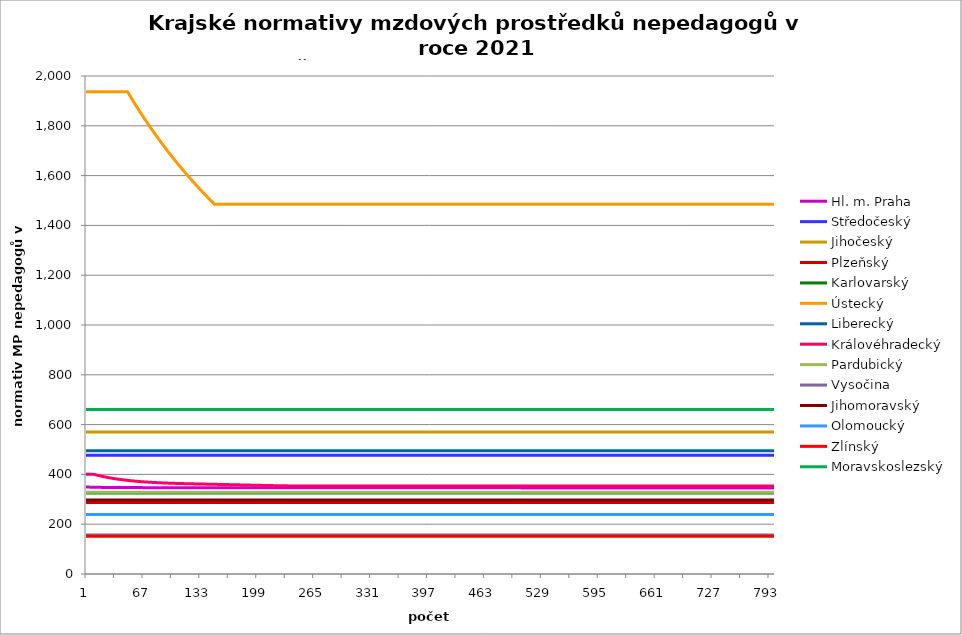
| Category | Hl. m. Praha | Středočeský | Jihočeský | Plzeňský | Karlovarský  | Ústecký   | Liberecký | Královéhradecký | Pardubický | Vysočina | Jihomoravský | Olomoucký | Zlínský | Moravskoslezský |
|---|---|---|---|---|---|---|---|---|---|---|---|---|---|---|
| 0 | 350.229 | 476.411 | 570.336 | 287.547 | 325.5 | 1937.113 | 495 | 400.548 | 328.432 | 156.391 | 297.28 | 238.483 | 151.2 | 660.577 |
| 1 | 349.669 | 476.411 | 570.336 | 287.547 | 325.5 | 1937.113 | 495 | 400.548 | 328.432 | 156.391 | 297.28 | 238.483 | 151.2 | 660.577 |
| 2 | 349.345 | 476.411 | 570.336 | 287.547 | 325.5 | 1937.113 | 495 | 400.548 | 328.432 | 156.391 | 297.28 | 238.483 | 151.2 | 660.577 |
| 3 | 349.116 | 476.411 | 570.336 | 287.547 | 325.5 | 1937.113 | 495 | 400.548 | 328.432 | 156.391 | 297.28 | 238.483 | 151.2 | 660.577 |
| 4 | 348.938 | 476.411 | 570.336 | 287.547 | 325.5 | 1937.113 | 495 | 400.548 | 328.432 | 156.391 | 297.28 | 238.483 | 151.2 | 660.577 |
| 5 | 348.794 | 476.411 | 570.336 | 287.547 | 325.5 | 1937.113 | 495 | 400.548 | 328.432 | 156.391 | 297.28 | 238.483 | 151.2 | 660.577 |
| 6 | 348.67 | 476.411 | 570.336 | 287.547 | 325.5 | 1937.113 | 495 | 400.548 | 328.432 | 156.391 | 297.28 | 238.483 | 151.2 | 660.577 |
| 7 | 348.56 | 476.411 | 570.336 | 287.547 | 325.5 | 1937.113 | 495 | 400.548 | 328.432 | 156.391 | 297.28 | 238.483 | 151.2 | 660.577 |
| 8 | 348.466 | 476.411 | 570.336 | 287.547 | 325.5 | 1937.113 | 495 | 400.548 | 328.432 | 156.391 | 297.28 | 238.483 | 151.2 | 660.577 |
| 9 | 348.382 | 476.411 | 570.336 | 287.547 | 325.5 | 1937.113 | 495 | 400.548 | 328.432 | 156.391 | 297.28 | 238.483 | 151.2 | 660.577 |
| 10 | 348.308 | 476.411 | 570.336 | 287.547 | 325.5 | 1937.113 | 495 | 399.617 | 328.432 | 156.391 | 297.28 | 238.483 | 151.2 | 660.577 |
| 11 | 348.239 | 476.411 | 570.336 | 287.547 | 325.5 | 1937.113 | 495 | 398.705 | 328.432 | 156.391 | 297.28 | 238.483 | 151.2 | 660.577 |
| 12 | 348.174 | 476.411 | 570.336 | 287.547 | 325.5 | 1937.113 | 495 | 397.81 | 328.432 | 156.391 | 297.28 | 238.483 | 151.2 | 660.577 |
| 13 | 348.115 | 476.411 | 570.336 | 287.547 | 325.5 | 1937.113 | 495 | 396.94 | 328.432 | 156.391 | 297.28 | 238.483 | 151.2 | 660.577 |
| 14 | 348.061 | 476.411 | 570.336 | 287.547 | 325.5 | 1937.113 | 495 | 396.087 | 328.432 | 156.391 | 297.28 | 238.483 | 151.2 | 660.577 |
| 15 | 348.011 | 476.411 | 570.336 | 287.547 | 325.5 | 1937.113 | 495 | 395.25 | 328.432 | 156.391 | 297.28 | 238.483 | 151.2 | 660.577 |
| 16 | 347.962 | 476.411 | 570.336 | 287.547 | 325.5 | 1937.113 | 495 | 394.437 | 328.432 | 156.391 | 297.28 | 238.483 | 151.2 | 660.577 |
| 17 | 347.917 | 476.411 | 570.336 | 287.547 | 325.5 | 1937.113 | 495 | 393.635 | 328.432 | 156.391 | 297.28 | 238.483 | 151.2 | 660.577 |
| 18 | 347.873 | 476.411 | 570.336 | 287.547 | 325.5 | 1937.113 | 495 | 392.855 | 328.432 | 156.391 | 297.28 | 238.483 | 151.2 | 660.577 |
| 19 | 347.833 | 476.411 | 570.336 | 287.547 | 325.5 | 1937.113 | 495 | 392.098 | 328.432 | 156.391 | 297.28 | 238.483 | 151.2 | 660.577 |
| 20 | 347.794 | 476.411 | 570.336 | 287.547 | 325.5 | 1937.113 | 495 | 391.35 | 328.432 | 156.391 | 297.28 | 238.483 | 151.2 | 660.577 |
| 21 | 347.755 | 476.411 | 570.336 | 287.547 | 325.5 | 1937.113 | 495 | 390.618 | 328.432 | 156.391 | 297.28 | 238.483 | 151.2 | 660.577 |
| 22 | 347.72 | 476.411 | 570.336 | 287.547 | 325.5 | 1937.113 | 495 | 389.909 | 328.432 | 156.391 | 297.28 | 238.483 | 151.2 | 660.577 |
| 23 | 347.686 | 476.411 | 570.336 | 287.547 | 325.5 | 1937.113 | 495 | 389.209 | 328.432 | 156.391 | 297.28 | 238.483 | 151.2 | 660.577 |
| 24 | 347.656 | 476.411 | 570.336 | 287.547 | 325.5 | 1937.113 | 495 | 388.53 | 328.432 | 156.391 | 297.28 | 238.483 | 151.2 | 660.577 |
| 25 | 347.621 | 476.411 | 570.336 | 287.547 | 325.5 | 1937.113 | 495 | 387.86 | 328.432 | 156.391 | 297.28 | 238.483 | 151.2 | 660.577 |
| 26 | 347.592 | 476.411 | 570.336 | 287.547 | 325.5 | 1937.113 | 495 | 387.212 | 328.432 | 156.391 | 297.28 | 238.483 | 151.2 | 660.577 |
| 27 | 347.567 | 476.411 | 570.336 | 287.547 | 325.5 | 1937.113 | 495 | 386.572 | 328.432 | 156.391 | 297.28 | 238.483 | 151.2 | 660.577 |
| 28 | 347.538 | 476.411 | 570.336 | 287.547 | 325.5 | 1937.113 | 495 | 385.948 | 328.432 | 156.391 | 297.28 | 238.483 | 151.2 | 660.577 |
| 29 | 347.508 | 476.411 | 570.336 | 287.547 | 325.5 | 1937.113 | 495 | 385.337 | 328.432 | 156.391 | 297.28 | 238.483 | 151.2 | 660.577 |
| 30 | 347.483 | 476.411 | 570.336 | 287.547 | 325.5 | 1937.113 | 495 | 384.742 | 328.432 | 156.391 | 297.28 | 238.483 | 151.2 | 660.577 |
| 31 | 347.459 | 476.411 | 570.336 | 287.547 | 325.5 | 1937.113 | 495 | 384.161 | 328.432 | 156.391 | 297.28 | 238.483 | 151.2 | 660.577 |
| 32 | 347.434 | 476.411 | 570.336 | 287.547 | 325.5 | 1937.113 | 495 | 383.594 | 328.432 | 156.391 | 297.28 | 238.483 | 151.2 | 660.577 |
| 33 | 347.41 | 476.411 | 570.336 | 287.547 | 325.5 | 1937.113 | 495 | 383.035 | 328.432 | 156.391 | 297.28 | 238.483 | 151.2 | 660.577 |
| 34 | 347.39 | 476.411 | 570.336 | 287.547 | 325.5 | 1937.113 | 495 | 382.49 | 328.432 | 156.391 | 297.28 | 238.483 | 151.2 | 660.577 |
| 35 | 347.365 | 476.411 | 570.336 | 287.547 | 325.5 | 1937.113 | 495 | 381.96 | 328.432 | 156.391 | 297.28 | 238.483 | 151.2 | 660.577 |
| 36 | 347.346 | 476.411 | 570.336 | 287.547 | 325.5 | 1937.113 | 495 | 381.443 | 328.432 | 156.391 | 297.28 | 238.483 | 151.2 | 660.577 |
| 37 | 347.321 | 476.411 | 570.336 | 287.547 | 325.5 | 1937.113 | 495 | 380.934 | 328.432 | 156.391 | 297.28 | 238.483 | 151.2 | 660.577 |
| 38 | 347.301 | 476.411 | 570.336 | 287.547 | 325.5 | 1937.113 | 495 | 380.438 | 328.432 | 156.391 | 297.28 | 238.483 | 151.2 | 660.577 |
| 39 | 347.282 | 476.411 | 570.336 | 287.547 | 325.5 | 1937.113 | 495 | 379.95 | 328.432 | 156.391 | 297.28 | 238.483 | 151.2 | 660.577 |
| 40 | 347.262 | 476.411 | 570.336 | 287.547 | 325.5 | 1937.113 | 495 | 379.476 | 328.432 | 156.391 | 297.28 | 238.483 | 151.2 | 660.577 |
| 41 | 347.242 | 476.411 | 570.336 | 287.547 | 325.5 | 1937.113 | 495 | 379.015 | 328.432 | 156.391 | 297.28 | 238.483 | 151.2 | 660.577 |
| 42 | 347.223 | 476.411 | 570.336 | 287.547 | 325.5 | 1937.113 | 495 | 378.561 | 328.432 | 156.391 | 297.28 | 238.483 | 151.2 | 660.577 |
| 43 | 347.208 | 476.411 | 570.336 | 287.547 | 325.5 | 1937.113 | 495 | 378.121 | 328.432 | 156.391 | 297.28 | 238.483 | 151.2 | 660.577 |
| 44 | 347.188 | 476.411 | 570.336 | 287.547 | 325.5 | 1937.113 | 495 | 377.687 | 328.432 | 156.391 | 297.28 | 238.483 | 151.2 | 660.577 |
| 45 | 347.173 | 476.411 | 570.336 | 287.547 | 325.5 | 1937.113 | 495 | 377.261 | 328.432 | 156.391 | 297.28 | 238.483 | 151.2 | 660.577 |
| 46 | 347.154 | 476.411 | 570.336 | 287.547 | 325.5 | 1937.113 | 495 | 376.848 | 328.432 | 156.391 | 297.28 | 238.483 | 151.2 | 660.577 |
| 47 | 347.139 | 476.411 | 570.336 | 287.547 | 325.5 | 1937.113 | 495 | 376.448 | 328.432 | 156.391 | 297.28 | 238.483 | 151.2 | 660.577 |
| 48 | 347.119 | 476.411 | 570.336 | 287.547 | 325.5 | 1937.113 | 495 | 376.055 | 328.432 | 156.391 | 297.28 | 238.483 | 151.2 | 660.577 |
| 49 | 347.1 | 476.411 | 570.336 | 287.547 | 325.5 | 1937.113 | 495 | 375.668 | 328.432 | 156.391 | 297.28 | 238.483 | 151.2 | 660.577 |
| 50 | 347.085 | 476.411 | 570.336 | 287.547 | 325.5 | 1926.226 | 495 | 375.295 | 328.432 | 156.391 | 297.28 | 238.483 | 151.2 | 660.577 |
| 51 | 347.07 | 476.411 | 570.336 | 287.547 | 325.5 | 1920.414 | 495 | 374.922 | 328.432 | 156.391 | 297.28 | 238.483 | 151.2 | 660.577 |
| 52 | 347.055 | 476.411 | 570.336 | 287.547 | 325.5 | 1914.637 | 495 | 374.568 | 328.432 | 156.391 | 297.28 | 238.483 | 151.2 | 660.577 |
| 53 | 347.041 | 476.411 | 570.336 | 287.547 | 325.5 | 1909.058 | 495 | 374.214 | 328.432 | 156.391 | 297.28 | 238.483 | 151.2 | 660.577 |
| 54 | 347.031 | 476.411 | 570.336 | 287.547 | 325.5 | 1903.349 | 495 | 373.874 | 328.432 | 156.391 | 297.28 | 238.483 | 151.2 | 660.577 |
| 55 | 347.016 | 476.411 | 570.336 | 287.547 | 325.5 | 1897.674 | 495 | 373.539 | 328.432 | 156.391 | 297.28 | 238.483 | 151.2 | 660.577 |
| 56 | 347.001 | 476.411 | 570.336 | 287.547 | 325.5 | 1892.194 | 495 | 373.212 | 328.432 | 156.391 | 297.28 | 238.483 | 151.2 | 660.577 |
| 57 | 346.987 | 476.411 | 570.336 | 287.547 | 325.5 | 1886.585 | 495 | 372.891 | 328.432 | 156.391 | 297.28 | 238.483 | 151.2 | 660.577 |
| 58 | 346.977 | 476.411 | 570.336 | 287.547 | 325.5 | 1881.01 | 495 | 372.576 | 328.432 | 156.391 | 297.28 | 238.483 | 151.2 | 660.577 |
| 59 | 346.962 | 476.411 | 570.336 | 287.547 | 325.5 | 1875.467 | 495 | 372.274 | 328.432 | 156.391 | 297.28 | 238.483 | 151.2 | 660.577 |
| 60 | 346.952 | 476.411 | 570.336 | 287.547 | 325.5 | 1870.114 | 495 | 371.978 | 328.432 | 156.391 | 297.28 | 238.483 | 151.2 | 660.577 |
| 61 | 346.938 | 476.411 | 570.336 | 287.547 | 325.5 | 1864.635 | 495 | 371.688 | 328.432 | 156.391 | 297.28 | 238.483 | 151.2 | 660.577 |
| 62 | 346.928 | 476.411 | 570.336 | 287.547 | 325.5 | 1859.189 | 495 | 371.399 | 328.432 | 156.391 | 297.28 | 238.483 | 151.2 | 660.577 |
| 63 | 346.913 | 476.411 | 570.336 | 287.547 | 325.5 | 1853.928 | 495 | 371.122 | 328.432 | 156.391 | 297.28 | 238.483 | 151.2 | 660.577 |
| 64 | 346.903 | 476.411 | 570.336 | 287.547 | 325.5 | 1848.544 | 495 | 370.852 | 328.432 | 156.391 | 297.28 | 238.483 | 151.2 | 660.577 |
| 65 | 346.893 | 476.411 | 570.336 | 287.547 | 325.5 | 1843.19 | 495 | 370.587 | 328.432 | 156.391 | 297.28 | 238.483 | 151.2 | 660.577 |
| 66 | 346.879 | 476.411 | 570.336 | 287.547 | 325.5 | 1838.02 | 495 | 370.329 | 328.432 | 156.391 | 297.28 | 238.483 | 151.2 | 660.577 |
| 67 | 346.869 | 476.411 | 570.336 | 287.547 | 325.5 | 1832.727 | 495 | 370.077 | 328.432 | 156.391 | 297.28 | 238.483 | 151.2 | 660.577 |
| 68 | 346.859 | 476.411 | 570.336 | 287.547 | 325.5 | 1827.465 | 495 | 369.832 | 328.432 | 156.391 | 297.28 | 238.483 | 151.2 | 660.577 |
| 69 | 346.849 | 476.411 | 570.336 | 287.547 | 325.5 | 1822.382 | 495 | 369.592 | 328.432 | 156.391 | 297.28 | 238.483 | 151.2 | 660.577 |
| 70 | 346.839 | 476.411 | 570.336 | 287.547 | 325.5 | 1817.179 | 495 | 369.359 | 328.432 | 156.391 | 297.28 | 238.483 | 151.2 | 660.577 |
| 71 | 346.83 | 476.411 | 570.336 | 287.547 | 325.5 | 1812.006 | 495 | 369.132 | 328.432 | 156.391 | 297.28 | 238.483 | 151.2 | 660.577 |
| 72 | 346.815 | 476.411 | 570.336 | 287.547 | 325.5 | 1806.862 | 495 | 368.905 | 328.432 | 156.391 | 297.28 | 238.483 | 151.2 | 660.577 |
| 73 | 346.805 | 476.411 | 570.336 | 287.547 | 325.5 | 1801.893 | 495 | 368.69 | 328.432 | 156.391 | 297.28 | 238.483 | 151.2 | 660.577 |
| 74 | 346.795 | 476.411 | 570.336 | 287.547 | 325.5 | 1796.806 | 495 | 368.475 | 328.432 | 156.391 | 297.28 | 238.483 | 151.2 | 660.577 |
| 75 | 346.785 | 476.411 | 570.336 | 287.547 | 325.5 | 1791.748 | 495 | 368.266 | 328.432 | 156.391 | 297.28 | 238.483 | 151.2 | 660.577 |
| 76 | 346.776 | 476.411 | 570.336 | 287.547 | 325.5 | 1786.861 | 495 | 368.063 | 328.432 | 156.391 | 297.28 | 238.483 | 151.2 | 660.577 |
| 77 | 346.766 | 476.411 | 570.336 | 287.547 | 325.5 | 1781.859 | 495 | 367.861 | 328.432 | 156.391 | 297.28 | 238.483 | 151.2 | 660.577 |
| 78 | 346.756 | 476.411 | 570.336 | 287.547 | 325.5 | 1776.884 | 495 | 367.67 | 328.432 | 156.391 | 297.28 | 238.483 | 151.2 | 660.577 |
| 79 | 346.746 | 476.411 | 570.336 | 287.547 | 325.5 | 1772.079 | 495 | 367.48 | 328.432 | 156.391 | 297.28 | 238.483 | 151.2 | 660.577 |
| 80 | 346.741 | 476.411 | 570.336 | 287.547 | 325.5 | 1767.158 | 495 | 367.295 | 328.432 | 156.391 | 297.28 | 238.483 | 151.2 | 660.577 |
| 81 | 346.732 | 476.411 | 570.336 | 287.547 | 325.5 | 1762.266 | 495 | 367.111 | 328.432 | 156.391 | 297.28 | 238.483 | 151.2 | 660.577 |
| 82 | 346.722 | 476.411 | 570.336 | 287.547 | 325.5 | 1757.4 | 495 | 366.938 | 328.432 | 156.391 | 297.28 | 238.483 | 151.2 | 660.577 |
| 83 | 346.712 | 476.411 | 570.336 | 287.547 | 325.5 | 1752.699 | 495 | 366.765 | 328.432 | 156.391 | 297.28 | 238.483 | 151.2 | 660.577 |
| 84 | 346.702 | 476.411 | 570.336 | 287.547 | 325.5 | 1747.885 | 495 | 366.593 | 328.432 | 156.391 | 297.28 | 238.483 | 151.2 | 660.577 |
| 85 | 346.692 | 476.411 | 570.336 | 287.547 | 325.5 | 1743.099 | 495 | 366.432 | 328.432 | 156.391 | 297.28 | 238.483 | 151.2 | 660.577 |
| 86 | 346.687 | 476.411 | 570.336 | 287.547 | 325.5 | 1738.474 | 495 | 366.266 | 328.432 | 156.391 | 297.28 | 238.483 | 151.2 | 660.577 |
| 87 | 346.678 | 476.411 | 570.336 | 287.547 | 325.5 | 1733.738 | 495 | 366.111 | 328.432 | 156.391 | 297.28 | 238.483 | 151.2 | 660.577 |
| 88 | 346.668 | 476.411 | 570.336 | 287.547 | 325.5 | 1729.028 | 495 | 365.957 | 328.432 | 156.391 | 297.28 | 238.483 | 151.2 | 660.577 |
| 89 | 346.663 | 476.411 | 570.336 | 287.547 | 325.5 | 1724.477 | 495 | 365.808 | 328.432 | 156.391 | 297.28 | 238.483 | 151.2 | 660.577 |
| 90 | 346.653 | 476.411 | 570.336 | 287.547 | 325.5 | 1719.818 | 495 | 365.659 | 328.432 | 156.391 | 297.28 | 238.483 | 151.2 | 660.577 |
| 91 | 346.643 | 476.411 | 570.336 | 287.547 | 325.5 | 1715.183 | 495 | 365.516 | 328.432 | 156.391 | 297.28 | 238.483 | 151.2 | 660.577 |
| 92 | 346.638 | 476.411 | 570.336 | 287.547 | 325.5 | 1710.705 | 495 | 365.374 | 328.432 | 156.391 | 297.28 | 238.483 | 151.2 | 660.577 |
| 93 | 346.629 | 476.411 | 570.336 | 287.547 | 325.5 | 1706.119 | 495 | 365.237 | 328.432 | 156.391 | 297.28 | 238.483 | 151.2 | 660.577 |
| 94 | 346.619 | 476.411 | 570.336 | 287.547 | 325.5 | 1701.558 | 495 | 365.1 | 328.432 | 156.391 | 297.28 | 238.483 | 151.2 | 660.577 |
| 95 | 346.614 | 476.411 | 570.336 | 287.547 | 325.5 | 1697.021 | 495 | 364.969 | 328.432 | 156.391 | 297.28 | 238.483 | 151.2 | 660.577 |
| 96 | 346.604 | 476.411 | 570.336 | 287.547 | 325.5 | 1692.637 | 495 | 364.844 | 328.432 | 156.391 | 297.28 | 238.483 | 151.2 | 660.577 |
| 97 | 346.599 | 476.411 | 570.336 | 287.547 | 325.5 | 1688.148 | 495 | 364.713 | 328.432 | 156.391 | 297.28 | 238.483 | 151.2 | 660.577 |
| 98 | 346.589 | 476.411 | 570.336 | 287.547 | 325.5 | 1683.682 | 495 | 364.594 | 328.432 | 156.391 | 297.28 | 238.483 | 151.2 | 660.577 |
| 99 | 346.584 | 476.411 | 570.336 | 287.547 | 325.5 | 1679.367 | 495 | 364.469 | 328.432 | 156.391 | 297.28 | 238.483 | 151.2 | 660.577 |
| 100 | 346.58 | 476.411 | 570.336 | 287.547 | 325.5 | 1674.947 | 495 | 364.35 | 328.432 | 156.391 | 297.28 | 238.483 | 151.2 | 660.577 |
| 101 | 346.575 | 476.411 | 570.336 | 287.547 | 325.5 | 1670.551 | 495 | 364.236 | 328.432 | 156.391 | 297.28 | 238.483 | 151.2 | 660.577 |
| 102 | 346.57 | 476.411 | 570.336 | 287.547 | 325.5 | 1666.303 | 495 | 364.123 | 328.432 | 156.391 | 297.28 | 238.483 | 151.2 | 660.577 |
| 103 | 346.565 | 476.411 | 570.336 | 287.547 | 325.5 | 1661.952 | 495 | 364.01 | 328.432 | 156.391 | 297.28 | 238.483 | 151.2 | 660.577 |
| 104 | 346.56 | 476.411 | 570.336 | 287.547 | 325.5 | 1657.623 | 495 | 363.902 | 328.432 | 156.391 | 297.28 | 238.483 | 151.2 | 660.577 |
| 105 | 346.555 | 476.411 | 570.336 | 287.547 | 325.5 | 1653.44 | 495 | 363.789 | 328.432 | 156.391 | 297.28 | 238.483 | 151.2 | 660.577 |
| 106 | 346.55 | 476.411 | 570.336 | 287.547 | 325.5 | 1649.156 | 495 | 363.687 | 328.432 | 156.391 | 297.28 | 238.483 | 151.2 | 660.577 |
| 107 | 346.545 | 476.411 | 570.336 | 287.547 | 325.5 | 1644.894 | 495 | 363.58 | 328.432 | 156.391 | 297.28 | 238.483 | 151.2 | 660.577 |
| 108 | 346.54 | 476.411 | 570.336 | 287.547 | 325.5 | 1640.654 | 495 | 363.478 | 328.432 | 156.391 | 297.28 | 238.483 | 151.2 | 660.577 |
| 109 | 346.535 | 476.411 | 570.336 | 287.547 | 325.5 | 1636.556 | 495 | 363.382 | 328.432 | 156.391 | 297.28 | 238.483 | 151.2 | 660.577 |
| 110 | 346.531 | 476.411 | 570.336 | 287.547 | 325.5 | 1632.359 | 495 | 363.281 | 328.432 | 156.391 | 297.28 | 238.483 | 151.2 | 660.577 |
| 111 | 346.526 | 476.411 | 570.336 | 287.547 | 325.5 | 1628.183 | 495 | 363.185 | 328.432 | 156.391 | 297.28 | 238.483 | 151.2 | 660.577 |
| 112 | 346.521 | 476.411 | 570.336 | 287.547 | 325.5 | 1624.147 | 495 | 363.089 | 328.432 | 156.391 | 297.28 | 238.483 | 151.2 | 660.577 |
| 113 | 346.516 | 476.411 | 570.336 | 287.547 | 325.5 | 1620.013 | 495 | 362.999 | 328.432 | 156.391 | 297.28 | 238.483 | 151.2 | 660.577 |
| 114 | 346.511 | 476.411 | 570.336 | 287.547 | 325.5 | 1615.9 | 495 | 362.903 | 328.432 | 156.391 | 297.28 | 238.483 | 151.2 | 660.577 |
| 115 | 346.506 | 476.411 | 570.336 | 287.547 | 325.5 | 1611.925 | 495 | 362.813 | 328.432 | 156.391 | 297.28 | 238.483 | 151.2 | 660.577 |
| 116 | 346.501 | 476.411 | 570.336 | 287.547 | 325.5 | 1607.853 | 495 | 362.723 | 328.432 | 156.391 | 297.28 | 238.483 | 151.2 | 660.577 |
| 117 | 346.496 | 476.411 | 570.336 | 287.547 | 325.5 | 1603.801 | 495 | 362.633 | 328.432 | 156.391 | 297.28 | 238.483 | 151.2 | 660.577 |
| 118 | 346.491 | 476.411 | 570.336 | 287.547 | 325.5 | 1599.885 | 495 | 362.549 | 328.432 | 156.391 | 297.28 | 238.483 | 151.2 | 660.577 |
| 119 | 346.487 | 476.411 | 570.336 | 287.547 | 325.5 | 1595.874 | 495 | 362.465 | 328.432 | 156.391 | 297.28 | 238.483 | 151.2 | 660.577 |
| 120 | 346.482 | 476.411 | 570.336 | 287.547 | 325.5 | 1591.882 | 495 | 362.375 | 328.432 | 156.391 | 297.28 | 238.483 | 151.2 | 660.577 |
| 121 | 346.477 | 476.411 | 570.336 | 287.547 | 325.5 | 1587.911 | 495 | 362.291 | 328.432 | 156.391 | 297.28 | 238.483 | 151.2 | 660.577 |
| 122 | 346.472 | 476.411 | 570.336 | 287.547 | 325.5 | 1584.072 | 495 | 362.212 | 328.432 | 156.391 | 297.28 | 238.483 | 151.2 | 660.577 |
| 123 | 346.472 | 476.411 | 570.336 | 287.547 | 325.5 | 1580.139 | 495 | 362.128 | 328.432 | 156.391 | 297.28 | 238.483 | 151.2 | 660.577 |
| 124 | 346.467 | 476.411 | 570.336 | 287.547 | 325.5 | 1576.226 | 495 | 362.05 | 328.432 | 156.391 | 297.28 | 238.483 | 151.2 | 660.577 |
| 125 | 346.462 | 476.411 | 570.336 | 287.547 | 325.5 | 1572.443 | 495 | 361.966 | 328.432 | 156.391 | 297.28 | 238.483 | 151.2 | 660.577 |
| 126 | 346.457 | 476.411 | 570.336 | 287.547 | 325.5 | 1568.568 | 495 | 361.887 | 328.432 | 156.391 | 297.28 | 238.483 | 151.2 | 660.577 |
| 127 | 346.452 | 476.411 | 570.336 | 287.547 | 325.5 | 1564.712 | 495 | 361.809 | 328.432 | 156.391 | 297.28 | 238.483 | 151.2 | 660.577 |
| 128 | 346.447 | 476.411 | 570.336 | 287.547 | 325.5 | 1560.984 | 495 | 361.731 | 328.432 | 156.391 | 297.28 | 238.483 | 151.2 | 660.577 |
| 129 | 346.442 | 476.411 | 570.336 | 287.547 | 325.5 | 1557.165 | 495 | 361.652 | 328.432 | 156.391 | 297.28 | 238.483 | 151.2 | 660.577 |
| 130 | 346.442 | 476.411 | 570.336 | 287.547 | 325.5 | 1553.364 | 495 | 361.574 | 328.432 | 156.391 | 297.28 | 238.483 | 151.2 | 660.577 |
| 131 | 346.438 | 476.411 | 570.336 | 287.547 | 325.5 | 1549.583 | 495 | 361.502 | 328.432 | 156.391 | 297.28 | 238.483 | 151.2 | 660.577 |
| 132 | 346.433 | 476.411 | 570.336 | 287.547 | 325.5 | 1545.926 | 495 | 361.423 | 328.432 | 156.391 | 297.28 | 238.483 | 151.2 | 660.577 |
| 133 | 346.428 | 476.411 | 570.336 | 287.547 | 325.5 | 1542.181 | 495 | 361.351 | 328.432 | 156.391 | 297.28 | 238.483 | 151.2 | 660.577 |
| 134 | 346.423 | 476.411 | 570.336 | 287.547 | 325.5 | 1538.453 | 495 | 361.273 | 328.432 | 156.391 | 297.28 | 238.483 | 151.2 | 660.577 |
| 135 | 346.423 | 476.411 | 570.336 | 287.547 | 325.5 | 1534.849 | 495 | 361.2 | 328.432 | 156.391 | 297.28 | 238.483 | 151.2 | 660.577 |
| 136 | 346.418 | 476.411 | 570.336 | 287.547 | 325.5 | 1531.157 | 495 | 361.122 | 328.432 | 156.391 | 297.28 | 238.483 | 151.2 | 660.577 |
| 137 | 346.413 | 476.411 | 570.336 | 287.547 | 325.5 | 1527.482 | 495 | 361.05 | 328.432 | 156.391 | 297.28 | 238.483 | 151.2 | 660.577 |
| 138 | 346.408 | 476.411 | 570.336 | 287.547 | 325.5 | 1523.929 | 495 | 360.977 | 328.432 | 156.391 | 297.28 | 238.483 | 151.2 | 660.577 |
| 139 | 346.403 | 476.411 | 570.336 | 287.547 | 325.5 | 1520.289 | 495 | 360.905 | 328.432 | 156.391 | 297.28 | 238.483 | 151.2 | 660.577 |
| 140 | 346.403 | 476.411 | 570.336 | 287.547 | 325.5 | 1516.667 | 495 | 360.827 | 328.432 | 156.391 | 297.28 | 238.483 | 151.2 | 660.577 |
| 141 | 346.398 | 476.411 | 570.336 | 287.547 | 325.5 | 1513.164 | 495 | 360.755 | 328.432 | 156.391 | 297.28 | 238.483 | 151.2 | 660.577 |
| 142 | 346.394 | 476.411 | 570.336 | 287.547 | 325.5 | 1509.575 | 495 | 360.683 | 328.432 | 156.391 | 297.28 | 238.483 | 151.2 | 660.577 |
| 143 | 346.389 | 476.411 | 570.336 | 287.547 | 325.5 | 1506.003 | 495 | 360.61 | 328.432 | 156.391 | 297.28 | 238.483 | 151.2 | 660.577 |
| 144 | 346.389 | 476.411 | 570.336 | 287.547 | 325.5 | 1502.448 | 495 | 360.538 | 328.432 | 156.391 | 297.28 | 238.483 | 151.2 | 660.577 |
| 145 | 346.384 | 476.411 | 570.336 | 287.547 | 325.5 | 1499.011 | 495 | 360.466 | 328.432 | 156.391 | 297.28 | 238.483 | 151.2 | 660.577 |
| 146 | 346.379 | 476.411 | 570.336 | 287.547 | 325.5 | 1495.489 | 495 | 360.394 | 328.432 | 156.391 | 297.28 | 238.483 | 151.2 | 660.577 |
| 147 | 346.374 | 476.411 | 570.336 | 287.547 | 325.5 | 1491.983 | 495 | 360.322 | 328.432 | 156.391 | 297.28 | 238.483 | 151.2 | 660.577 |
| 148 | 346.374 | 476.411 | 570.336 | 287.547 | 325.5 | 1488.593 | 495 | 360.244 | 328.432 | 156.391 | 297.28 | 238.483 | 151.2 | 660.577 |
| 149 | 346.369 | 476.411 | 570.336 | 287.547 | 325.5 | 1485.12 | 495 | 360.172 | 328.432 | 156.391 | 297.28 | 238.483 | 151.2 | 660.577 |
| 150 | 346.369 | 476.411 | 570.336 | 287.547 | 325.5 | 1485.12 | 495 | 360.1 | 328.432 | 156.391 | 297.28 | 238.483 | 151.2 | 660.577 |
| 151 | 346.364 | 476.411 | 570.336 | 287.547 | 325.5 | 1485.12 | 495 | 360.028 | 328.432 | 156.391 | 297.28 | 238.483 | 151.2 | 660.577 |
| 152 | 346.364 | 476.411 | 570.336 | 287.547 | 325.5 | 1485.12 | 495 | 359.956 | 328.432 | 156.391 | 297.28 | 238.483 | 151.2 | 660.577 |
| 153 | 346.359 | 476.411 | 570.336 | 287.547 | 325.5 | 1485.12 | 495 | 359.884 | 328.432 | 156.391 | 297.28 | 238.483 | 151.2 | 660.577 |
| 154 | 346.359 | 476.411 | 570.336 | 287.547 | 325.5 | 1485.12 | 495 | 359.806 | 328.432 | 156.391 | 297.28 | 238.483 | 151.2 | 660.577 |
| 155 | 346.354 | 476.411 | 570.336 | 287.547 | 325.5 | 1485.12 | 495 | 359.734 | 328.432 | 156.391 | 297.28 | 238.483 | 151.2 | 660.577 |
| 156 | 346.354 | 476.411 | 570.336 | 287.547 | 325.5 | 1485.12 | 495 | 359.662 | 328.432 | 156.391 | 297.28 | 238.483 | 151.2 | 660.577 |
| 157 | 346.349 | 476.411 | 570.336 | 287.547 | 325.5 | 1485.12 | 495 | 359.585 | 328.432 | 156.391 | 297.28 | 238.483 | 151.2 | 660.577 |
| 158 | 346.349 | 476.411 | 570.336 | 287.547 | 325.5 | 1485.12 | 495 | 359.513 | 328.432 | 156.391 | 297.28 | 238.483 | 151.2 | 660.577 |
| 159 | 346.345 | 476.411 | 570.336 | 287.547 | 325.5 | 1485.12 | 495 | 359.436 | 328.432 | 156.391 | 297.28 | 238.483 | 151.2 | 660.577 |
| 160 | 346.345 | 476.411 | 570.336 | 287.547 | 325.5 | 1485.12 | 495 | 359.364 | 328.432 | 156.391 | 297.28 | 238.483 | 151.2 | 660.577 |
| 161 | 346.34 | 476.411 | 570.336 | 287.547 | 325.5 | 1485.12 | 495 | 359.287 | 328.432 | 156.391 | 297.28 | 238.483 | 151.2 | 660.577 |
| 162 | 346.34 | 476.411 | 570.336 | 287.547 | 325.5 | 1485.12 | 495 | 359.215 | 328.432 | 156.391 | 297.28 | 238.483 | 151.2 | 660.577 |
| 163 | 346.335 | 476.411 | 570.336 | 287.547 | 325.5 | 1485.12 | 495 | 359.138 | 328.432 | 156.391 | 297.28 | 238.483 | 151.2 | 660.577 |
| 164 | 346.335 | 476.411 | 570.336 | 287.547 | 325.5 | 1485.12 | 495 | 359.061 | 328.432 | 156.391 | 297.28 | 238.483 | 151.2 | 660.577 |
| 165 | 346.33 | 476.411 | 570.336 | 287.547 | 325.5 | 1485.12 | 495 | 358.989 | 328.432 | 156.391 | 297.28 | 238.483 | 151.2 | 660.577 |
| 166 | 346.33 | 476.411 | 570.336 | 287.547 | 325.5 | 1485.12 | 495 | 358.912 | 328.432 | 156.391 | 297.28 | 238.483 | 151.2 | 660.577 |
| 167 | 346.325 | 476.411 | 570.336 | 287.547 | 325.5 | 1485.12 | 495 | 358.835 | 328.432 | 156.391 | 297.28 | 238.483 | 151.2 | 660.577 |
| 168 | 346.325 | 476.411 | 570.336 | 287.547 | 325.5 | 1485.12 | 495 | 358.758 | 328.432 | 156.391 | 297.28 | 238.483 | 151.2 | 660.577 |
| 169 | 346.32 | 476.411 | 570.336 | 287.547 | 325.5 | 1485.12 | 495 | 358.681 | 328.432 | 156.391 | 297.28 | 238.483 | 151.2 | 660.577 |
| 170 | 346.32 | 476.411 | 570.336 | 287.547 | 325.5 | 1485.12 | 495 | 358.604 | 328.432 | 156.391 | 297.28 | 238.483 | 151.2 | 660.577 |
| 171 | 346.315 | 476.411 | 570.336 | 287.547 | 325.5 | 1485.12 | 495 | 358.527 | 328.432 | 156.391 | 297.28 | 238.483 | 151.2 | 660.577 |
| 172 | 346.315 | 476.411 | 570.336 | 287.547 | 325.5 | 1485.12 | 495 | 358.45 | 328.432 | 156.391 | 297.28 | 238.483 | 151.2 | 660.577 |
| 173 | 346.31 | 476.411 | 570.336 | 287.547 | 325.5 | 1485.12 | 495 | 358.368 | 328.432 | 156.391 | 297.28 | 238.483 | 151.2 | 660.577 |
| 174 | 346.31 | 476.411 | 570.336 | 287.547 | 325.5 | 1485.12 | 495 | 358.291 | 328.432 | 156.391 | 297.28 | 238.483 | 151.2 | 660.577 |
| 175 | 346.305 | 476.411 | 570.336 | 287.547 | 325.5 | 1485.12 | 495 | 358.214 | 328.432 | 156.391 | 297.28 | 238.483 | 151.2 | 660.577 |
| 176 | 346.305 | 476.411 | 570.336 | 287.547 | 325.5 | 1485.12 | 495 | 358.132 | 328.432 | 156.391 | 297.28 | 238.483 | 151.2 | 660.577 |
| 177 | 346.301 | 476.411 | 570.336 | 287.547 | 325.5 | 1485.12 | 495 | 358.055 | 328.432 | 156.391 | 297.28 | 238.483 | 151.2 | 660.577 |
| 178 | 346.301 | 476.411 | 570.336 | 287.547 | 325.5 | 1485.12 | 495 | 357.973 | 328.432 | 156.391 | 297.28 | 238.483 | 151.2 | 660.577 |
| 179 | 346.296 | 476.411 | 570.336 | 287.547 | 325.5 | 1485.12 | 495 | 357.897 | 328.432 | 156.391 | 297.28 | 238.483 | 151.2 | 660.577 |
| 180 | 346.296 | 476.411 | 570.336 | 287.547 | 325.5 | 1485.12 | 495 | 357.815 | 328.432 | 156.391 | 297.28 | 238.483 | 151.2 | 660.577 |
| 181 | 346.296 | 476.411 | 570.336 | 287.547 | 325.5 | 1485.12 | 495 | 357.738 | 328.432 | 156.391 | 297.28 | 238.483 | 151.2 | 660.577 |
| 182 | 346.291 | 476.411 | 570.336 | 287.547 | 325.5 | 1485.12 | 495 | 357.656 | 328.432 | 156.391 | 297.28 | 238.483 | 151.2 | 660.577 |
| 183 | 346.291 | 476.411 | 570.336 | 287.547 | 325.5 | 1485.12 | 495 | 357.574 | 328.432 | 156.391 | 297.28 | 238.483 | 151.2 | 660.577 |
| 184 | 346.286 | 476.411 | 570.336 | 287.547 | 325.5 | 1485.12 | 495 | 357.498 | 328.432 | 156.391 | 297.28 | 238.483 | 151.2 | 660.577 |
| 185 | 346.286 | 476.411 | 570.336 | 287.547 | 325.5 | 1485.12 | 495 | 357.416 | 328.432 | 156.391 | 297.28 | 238.483 | 151.2 | 660.577 |
| 186 | 346.281 | 476.411 | 570.336 | 287.547 | 325.5 | 1485.12 | 495 | 357.334 | 328.432 | 156.391 | 297.28 | 238.483 | 151.2 | 660.577 |
| 187 | 346.281 | 476.411 | 570.336 | 287.547 | 325.5 | 1485.12 | 495 | 357.252 | 328.432 | 156.391 | 297.28 | 238.483 | 151.2 | 660.577 |
| 188 | 346.276 | 476.411 | 570.336 | 287.547 | 325.5 | 1485.12 | 495 | 357.17 | 328.432 | 156.391 | 297.28 | 238.483 | 151.2 | 660.577 |
| 189 | 346.276 | 476.411 | 570.336 | 287.547 | 325.5 | 1485.12 | 495 | 357.094 | 328.432 | 156.391 | 297.28 | 238.483 | 151.2 | 660.577 |
| 190 | 346.276 | 476.411 | 570.336 | 287.547 | 325.5 | 1485.12 | 495 | 357.012 | 328.432 | 156.391 | 297.28 | 238.483 | 151.2 | 660.577 |
| 191 | 346.271 | 476.411 | 570.336 | 287.547 | 325.5 | 1485.12 | 495 | 356.93 | 328.432 | 156.391 | 297.28 | 238.483 | 151.2 | 660.577 |
| 192 | 346.271 | 476.411 | 570.336 | 287.547 | 325.5 | 1485.12 | 495 | 356.849 | 328.432 | 156.391 | 297.28 | 238.483 | 151.2 | 660.577 |
| 193 | 346.266 | 476.411 | 570.336 | 287.547 | 325.5 | 1485.12 | 495 | 356.767 | 328.432 | 156.391 | 297.28 | 238.483 | 151.2 | 660.577 |
| 194 | 346.266 | 476.411 | 570.336 | 287.547 | 325.5 | 1485.12 | 495 | 356.686 | 328.432 | 156.391 | 297.28 | 238.483 | 151.2 | 660.577 |
| 195 | 346.261 | 476.411 | 570.336 | 287.547 | 325.5 | 1485.12 | 495 | 356.604 | 328.432 | 156.391 | 297.28 | 238.483 | 151.2 | 660.577 |
| 196 | 346.261 | 476.411 | 570.336 | 287.547 | 325.5 | 1485.12 | 495 | 356.523 | 328.432 | 156.391 | 297.28 | 238.483 | 151.2 | 660.577 |
| 197 | 346.261 | 476.411 | 570.336 | 287.547 | 325.5 | 1485.12 | 495 | 356.441 | 328.432 | 156.391 | 297.28 | 238.483 | 151.2 | 660.577 |
| 198 | 346.257 | 476.411 | 570.336 | 287.547 | 325.5 | 1485.12 | 495 | 356.36 | 328.432 | 156.391 | 297.28 | 238.483 | 151.2 | 660.577 |
| 199 | 346.257 | 476.411 | 570.336 | 287.547 | 325.5 | 1485.12 | 495 | 356.284 | 328.432 | 156.391 | 297.28 | 238.483 | 151.2 | 660.577 |
| 200 | 346.252 | 476.411 | 570.336 | 287.547 | 325.5 | 1485.12 | 495 | 356.202 | 328.432 | 156.391 | 297.28 | 238.483 | 151.2 | 660.577 |
| 201 | 346.252 | 476.411 | 570.336 | 287.547 | 325.5 | 1485.12 | 495 | 356.121 | 328.432 | 156.391 | 297.28 | 238.483 | 151.2 | 660.577 |
| 202 | 346.252 | 476.411 | 570.336 | 287.547 | 325.5 | 1485.12 | 495 | 356.04 | 328.432 | 156.391 | 297.28 | 238.483 | 151.2 | 660.577 |
| 203 | 346.247 | 476.411 | 570.336 | 287.547 | 325.5 | 1485.12 | 495 | 355.964 | 328.432 | 156.391 | 297.28 | 238.483 | 151.2 | 660.577 |
| 204 | 346.247 | 476.411 | 570.336 | 287.547 | 325.5 | 1485.12 | 495 | 355.883 | 328.432 | 156.391 | 297.28 | 238.483 | 151.2 | 660.577 |
| 205 | 346.242 | 476.411 | 570.336 | 287.547 | 325.5 | 1485.12 | 495 | 355.807 | 328.432 | 156.391 | 297.28 | 238.483 | 151.2 | 660.577 |
| 206 | 346.242 | 476.411 | 570.336 | 287.547 | 325.5 | 1485.12 | 495 | 355.726 | 328.432 | 156.391 | 297.28 | 238.483 | 151.2 | 660.577 |
| 207 | 346.242 | 476.411 | 570.336 | 287.547 | 325.5 | 1485.12 | 495 | 355.65 | 328.432 | 156.391 | 297.28 | 238.483 | 151.2 | 660.577 |
| 208 | 346.237 | 476.411 | 570.336 | 287.547 | 325.5 | 1485.12 | 495 | 355.569 | 328.432 | 156.391 | 297.28 | 238.483 | 151.2 | 660.577 |
| 209 | 346.237 | 476.411 | 570.336 | 287.547 | 325.5 | 1485.12 | 495 | 355.493 | 328.432 | 156.391 | 297.28 | 238.483 | 151.2 | 660.577 |
| 210 | 346.232 | 476.411 | 570.336 | 287.547 | 325.5 | 1485.12 | 495 | 355.418 | 328.432 | 156.391 | 297.28 | 238.483 | 151.2 | 660.577 |
| 211 | 346.232 | 476.411 | 570.336 | 287.547 | 325.5 | 1485.12 | 495 | 355.342 | 328.432 | 156.391 | 297.28 | 238.483 | 151.2 | 660.577 |
| 212 | 346.232 | 476.411 | 570.336 | 287.547 | 325.5 | 1485.12 | 495 | 355.267 | 328.432 | 156.391 | 297.28 | 238.483 | 151.2 | 660.577 |
| 213 | 346.227 | 476.411 | 570.336 | 287.547 | 325.5 | 1485.12 | 495 | 355.191 | 328.432 | 156.391 | 297.28 | 238.483 | 151.2 | 660.577 |
| 214 | 346.227 | 476.411 | 570.336 | 287.547 | 325.5 | 1485.12 | 495 | 355.121 | 328.432 | 156.391 | 297.28 | 238.483 | 151.2 | 660.577 |
| 215 | 346.222 | 476.411 | 570.336 | 287.547 | 325.5 | 1485.12 | 495 | 355.046 | 328.432 | 156.391 | 297.28 | 238.483 | 151.2 | 660.577 |
| 216 | 346.222 | 476.411 | 570.336 | 287.547 | 325.5 | 1485.12 | 495 | 354.976 | 328.432 | 156.391 | 297.28 | 238.483 | 151.2 | 660.577 |
| 217 | 346.222 | 476.411 | 570.336 | 287.547 | 325.5 | 1485.12 | 495 | 354.906 | 328.432 | 156.391 | 297.28 | 238.483 | 151.2 | 660.577 |
| 218 | 346.217 | 476.411 | 570.336 | 287.547 | 325.5 | 1485.12 | 495 | 354.836 | 328.432 | 156.391 | 297.28 | 238.483 | 151.2 | 660.577 |
| 219 | 346.217 | 476.411 | 570.336 | 287.547 | 325.5 | 1485.12 | 495 | 354.766 | 328.432 | 156.391 | 297.28 | 238.483 | 151.2 | 660.577 |
| 220 | 346.217 | 476.411 | 570.336 | 287.547 | 325.5 | 1485.12 | 495 | 354.696 | 328.432 | 156.391 | 297.28 | 238.483 | 151.2 | 660.577 |
| 221 | 346.213 | 476.411 | 570.336 | 287.547 | 325.5 | 1485.12 | 495 | 354.631 | 328.432 | 156.391 | 297.28 | 238.483 | 151.2 | 660.577 |
| 222 | 346.213 | 476.411 | 570.336 | 287.547 | 325.5 | 1485.12 | 495 | 354.567 | 328.432 | 156.391 | 297.28 | 238.483 | 151.2 | 660.577 |
| 223 | 346.208 | 476.411 | 570.336 | 287.547 | 325.5 | 1485.12 | 495 | 354.502 | 328.432 | 156.391 | 297.28 | 238.483 | 151.2 | 660.577 |
| 224 | 346.208 | 476.411 | 570.336 | 287.547 | 325.5 | 1485.12 | 495 | 354.438 | 328.432 | 156.391 | 297.28 | 238.483 | 151.2 | 660.577 |
| 225 | 346.208 | 476.411 | 570.336 | 287.547 | 325.5 | 1485.12 | 495 | 354.374 | 328.432 | 156.391 | 297.28 | 238.483 | 151.2 | 660.577 |
| 226 | 346.203 | 476.411 | 570.336 | 287.547 | 325.5 | 1485.12 | 495 | 354.315 | 328.432 | 156.391 | 297.28 | 238.483 | 151.2 | 660.577 |
| 227 | 346.203 | 476.411 | 570.336 | 287.547 | 325.5 | 1485.12 | 495 | 354.256 | 328.432 | 156.391 | 297.28 | 238.483 | 151.2 | 660.577 |
| 228 | 346.203 | 476.411 | 570.336 | 287.547 | 325.5 | 1485.12 | 495 | 354.197 | 328.432 | 156.391 | 297.28 | 238.483 | 151.2 | 660.577 |
| 229 | 346.198 | 476.411 | 570.336 | 287.547 | 325.5 | 1485.12 | 495 | 354.143 | 328.432 | 156.391 | 297.28 | 238.483 | 151.2 | 660.577 |
| 230 | 346.198 | 476.411 | 570.336 | 287.547 | 325.5 | 1485.12 | 495 | 354.089 | 328.432 | 156.391 | 297.28 | 238.483 | 151.2 | 660.577 |
| 231 | 346.198 | 476.411 | 570.336 | 287.547 | 325.5 | 1485.12 | 495 | 354.036 | 328.432 | 156.391 | 297.28 | 238.483 | 151.2 | 660.577 |
| 232 | 346.193 | 476.411 | 570.336 | 287.547 | 325.5 | 1485.12 | 495 | 353.982 | 328.432 | 156.391 | 297.28 | 238.483 | 151.2 | 660.577 |
| 233 | 346.193 | 476.411 | 570.336 | 287.547 | 325.5 | 1485.12 | 495 | 353.934 | 328.432 | 156.391 | 297.28 | 238.483 | 151.2 | 660.577 |
| 234 | 346.193 | 476.411 | 570.336 | 287.547 | 325.5 | 1485.12 | 495 | 353.886 | 328.432 | 156.391 | 297.28 | 238.483 | 151.2 | 660.577 |
| 235 | 346.188 | 476.411 | 570.336 | 287.547 | 325.5 | 1485.12 | 495 | 353.843 | 328.432 | 156.391 | 297.28 | 238.483 | 151.2 | 660.577 |
| 236 | 346.188 | 476.411 | 570.336 | 287.547 | 325.5 | 1485.12 | 495 | 353.8 | 328.432 | 156.391 | 297.28 | 238.483 | 151.2 | 660.577 |
| 237 | 346.183 | 476.411 | 570.336 | 287.547 | 325.5 | 1485.12 | 495 | 353.758 | 328.432 | 156.391 | 297.28 | 238.483 | 151.2 | 660.577 |
| 238 | 346.183 | 476.411 | 570.336 | 287.547 | 325.5 | 1485.12 | 495 | 353.72 | 328.432 | 156.391 | 297.28 | 238.483 | 151.2 | 660.577 |
| 239 | 346.183 | 476.411 | 570.336 | 287.547 | 325.5 | 1485.12 | 495 | 353.683 | 328.432 | 156.391 | 297.28 | 238.483 | 151.2 | 660.577 |
| 240 | 346.178 | 476.411 | 570.336 | 287.547 | 325.5 | 1485.12 | 495 | 353.645 | 328.432 | 156.391 | 297.28 | 238.483 | 151.2 | 660.577 |
| 241 | 346.178 | 476.411 | 570.336 | 287.547 | 325.5 | 1485.12 | 495 | 353.613 | 328.432 | 156.391 | 297.28 | 238.483 | 151.2 | 660.577 |
| 242 | 346.178 | 476.411 | 570.336 | 287.547 | 325.5 | 1485.12 | 495 | 353.586 | 328.432 | 156.391 | 297.28 | 238.483 | 151.2 | 660.577 |
| 243 | 346.173 | 476.411 | 570.336 | 287.547 | 325.5 | 1485.12 | 495 | 353.554 | 328.432 | 156.391 | 297.28 | 238.483 | 151.2 | 660.577 |
| 244 | 346.173 | 476.411 | 570.336 | 287.547 | 325.5 | 1485.12 | 495 | 353.533 | 328.432 | 156.391 | 297.28 | 238.483 | 151.2 | 660.577 |
| 245 | 346.173 | 476.411 | 570.336 | 287.547 | 325.5 | 1485.12 | 495 | 353.512 | 328.432 | 156.391 | 297.28 | 238.483 | 151.2 | 660.577 |
| 246 | 346.169 | 476.411 | 570.336 | 287.547 | 325.5 | 1485.12 | 495 | 353.49 | 328.432 | 156.391 | 297.28 | 238.483 | 151.2 | 660.577 |
| 247 | 346.169 | 476.411 | 570.336 | 287.547 | 325.5 | 1485.12 | 495 | 353.474 | 328.432 | 156.391 | 297.28 | 238.483 | 151.2 | 660.577 |
| 248 | 346.169 | 476.411 | 570.336 | 287.547 | 325.5 | 1485.12 | 495 | 353.474 | 328.432 | 156.391 | 297.28 | 238.483 | 151.2 | 660.577 |
| 249 | 346.164 | 476.411 | 570.336 | 287.547 | 325.5 | 1485.12 | 495 | 353.474 | 328.432 | 156.391 | 297.28 | 238.483 | 151.2 | 660.577 |
| 250 | 346.164 | 476.411 | 570.336 | 287.547 | 325.5 | 1485.12 | 495 | 353.474 | 328.432 | 156.391 | 297.28 | 238.483 | 151.2 | 660.577 |
| 251 | 346.164 | 476.411 | 570.336 | 287.547 | 325.5 | 1485.12 | 495 | 353.474 | 328.432 | 156.391 | 297.28 | 238.483 | 151.2 | 660.577 |
| 252 | 346.159 | 476.411 | 570.336 | 287.547 | 325.5 | 1485.12 | 495 | 353.474 | 328.432 | 156.391 | 297.28 | 238.483 | 151.2 | 660.577 |
| 253 | 346.159 | 476.411 | 570.336 | 287.547 | 325.5 | 1485.12 | 495 | 353.474 | 328.432 | 156.391 | 297.28 | 238.483 | 151.2 | 660.577 |
| 254 | 346.159 | 476.411 | 570.336 | 287.547 | 325.5 | 1485.12 | 495 | 353.474 | 328.432 | 156.391 | 297.28 | 238.483 | 151.2 | 660.577 |
| 255 | 346.154 | 476.411 | 570.336 | 287.547 | 325.5 | 1485.12 | 495 | 353.474 | 328.432 | 156.391 | 297.28 | 238.483 | 151.2 | 660.577 |
| 256 | 346.154 | 476.411 | 570.336 | 287.547 | 325.5 | 1485.12 | 495 | 353.474 | 328.432 | 156.391 | 297.28 | 238.483 | 151.2 | 660.577 |
| 257 | 346.154 | 476.411 | 570.336 | 287.547 | 325.5 | 1485.12 | 495 | 353.474 | 328.432 | 156.391 | 297.28 | 238.483 | 151.2 | 660.577 |
| 258 | 346.154 | 476.411 | 570.336 | 287.547 | 325.5 | 1485.12 | 495 | 353.474 | 328.432 | 156.391 | 297.28 | 238.483 | 151.2 | 660.577 |
| 259 | 346.149 | 476.411 | 570.336 | 287.547 | 325.5 | 1485.12 | 495 | 353.474 | 328.432 | 156.391 | 297.28 | 238.483 | 151.2 | 660.577 |
| 260 | 346.149 | 476.411 | 570.336 | 287.547 | 325.5 | 1485.12 | 495 | 353.474 | 328.432 | 156.391 | 297.28 | 238.483 | 151.2 | 660.577 |
| 261 | 346.149 | 476.411 | 570.336 | 287.547 | 325.5 | 1485.12 | 495 | 353.474 | 328.432 | 156.391 | 297.28 | 238.483 | 151.2 | 660.577 |
| 262 | 346.144 | 476.411 | 570.336 | 287.547 | 325.5 | 1485.12 | 495 | 353.474 | 328.432 | 156.391 | 297.28 | 238.483 | 151.2 | 660.577 |
| 263 | 346.144 | 476.411 | 570.336 | 287.547 | 325.5 | 1485.12 | 495 | 353.474 | 328.432 | 156.391 | 297.28 | 238.483 | 151.2 | 660.577 |
| 264 | 346.144 | 476.411 | 570.336 | 287.547 | 325.5 | 1485.12 | 495 | 353.474 | 328.432 | 156.391 | 297.28 | 238.483 | 151.2 | 660.577 |
| 265 | 346.139 | 476.411 | 570.336 | 287.547 | 325.5 | 1485.12 | 495 | 353.474 | 328.432 | 156.391 | 297.28 | 238.483 | 151.2 | 660.577 |
| 266 | 346.139 | 476.411 | 570.336 | 287.547 | 325.5 | 1485.12 | 495 | 353.474 | 328.432 | 156.391 | 297.28 | 238.483 | 151.2 | 660.577 |
| 267 | 346.139 | 476.411 | 570.336 | 287.547 | 325.5 | 1485.12 | 495 | 353.474 | 328.432 | 156.391 | 297.28 | 238.483 | 151.2 | 660.577 |
| 268 | 346.134 | 476.411 | 570.336 | 287.547 | 325.5 | 1485.12 | 495 | 353.474 | 328.432 | 156.391 | 297.28 | 238.483 | 151.2 | 660.577 |
| 269 | 346.134 | 476.411 | 570.336 | 287.547 | 325.5 | 1485.12 | 495 | 353.474 | 328.432 | 156.391 | 297.28 | 238.483 | 151.2 | 660.577 |
| 270 | 346.134 | 476.411 | 570.336 | 287.547 | 325.5 | 1485.12 | 495 | 353.474 | 328.432 | 156.391 | 297.28 | 238.483 | 151.2 | 660.577 |
| 271 | 346.129 | 476.411 | 570.336 | 287.547 | 325.5 | 1485.12 | 495 | 353.474 | 328.432 | 156.391 | 297.28 | 238.483 | 151.2 | 660.577 |
| 272 | 346.129 | 476.411 | 570.336 | 287.547 | 325.5 | 1485.12 | 495 | 353.474 | 328.432 | 156.391 | 297.28 | 238.483 | 151.2 | 660.577 |
| 273 | 346.129 | 476.411 | 570.336 | 287.547 | 325.5 | 1485.12 | 495 | 353.474 | 328.432 | 156.391 | 297.28 | 238.483 | 151.2 | 660.577 |
| 274 | 346.129 | 476.411 | 570.336 | 287.547 | 325.5 | 1485.12 | 495 | 353.474 | 328.432 | 156.391 | 297.28 | 238.483 | 151.2 | 660.577 |
| 275 | 346.125 | 476.411 | 570.336 | 287.547 | 325.5 | 1485.12 | 495 | 353.474 | 328.432 | 156.391 | 297.28 | 238.483 | 151.2 | 660.577 |
| 276 | 346.125 | 476.411 | 570.336 | 287.547 | 325.5 | 1485.12 | 495 | 353.474 | 328.432 | 156.391 | 297.28 | 238.483 | 151.2 | 660.577 |
| 277 | 346.125 | 476.411 | 570.336 | 287.547 | 325.5 | 1485.12 | 495 | 353.474 | 328.432 | 156.391 | 297.28 | 238.483 | 151.2 | 660.577 |
| 278 | 346.12 | 476.411 | 570.336 | 287.547 | 325.5 | 1485.12 | 495 | 353.474 | 328.432 | 156.391 | 297.28 | 238.483 | 151.2 | 660.577 |
| 279 | 346.12 | 476.411 | 570.336 | 287.547 | 325.5 | 1485.12 | 495 | 353.474 | 328.432 | 156.391 | 297.28 | 238.483 | 151.2 | 660.577 |
| 280 | 346.12 | 476.411 | 570.336 | 287.547 | 325.5 | 1485.12 | 495 | 353.474 | 328.432 | 156.391 | 297.28 | 238.483 | 151.2 | 660.577 |
| 281 | 346.12 | 476.411 | 570.336 | 287.547 | 325.5 | 1485.12 | 495 | 353.474 | 328.432 | 156.391 | 297.28 | 238.483 | 151.2 | 660.577 |
| 282 | 346.115 | 476.411 | 570.336 | 287.547 | 325.5 | 1485.12 | 495 | 353.474 | 328.432 | 156.391 | 297.28 | 238.483 | 151.2 | 660.577 |
| 283 | 346.115 | 476.411 | 570.336 | 287.547 | 325.5 | 1485.12 | 495 | 353.474 | 328.432 | 156.391 | 297.28 | 238.483 | 151.2 | 660.577 |
| 284 | 346.115 | 476.411 | 570.336 | 287.547 | 325.5 | 1485.12 | 495 | 353.474 | 328.432 | 156.391 | 297.28 | 238.483 | 151.2 | 660.577 |
| 285 | 346.11 | 476.411 | 570.336 | 287.547 | 325.5 | 1485.12 | 495 | 353.474 | 328.432 | 156.391 | 297.28 | 238.483 | 151.2 | 660.577 |
| 286 | 346.11 | 476.411 | 570.336 | 287.547 | 325.5 | 1485.12 | 495 | 353.474 | 328.432 | 156.391 | 297.28 | 238.483 | 151.2 | 660.577 |
| 287 | 346.11 | 476.411 | 570.336 | 287.547 | 325.5 | 1485.12 | 495 | 353.474 | 328.432 | 156.391 | 297.28 | 238.483 | 151.2 | 660.577 |
| 288 | 346.105 | 476.411 | 570.336 | 287.547 | 325.5 | 1485.12 | 495 | 353.474 | 328.432 | 156.391 | 297.28 | 238.483 | 151.2 | 660.577 |
| 289 | 346.105 | 476.411 | 570.336 | 287.547 | 325.5 | 1485.12 | 495 | 353.474 | 328.432 | 156.391 | 297.28 | 238.483 | 151.2 | 660.577 |
| 290 | 346.105 | 476.411 | 570.336 | 287.547 | 325.5 | 1485.12 | 495 | 353.474 | 328.432 | 156.391 | 297.28 | 238.483 | 151.2 | 660.577 |
| 291 | 346.105 | 476.411 | 570.336 | 287.547 | 325.5 | 1485.12 | 495 | 353.474 | 328.432 | 156.391 | 297.28 | 238.483 | 151.2 | 660.577 |
| 292 | 346.1 | 476.411 | 570.336 | 287.547 | 325.5 | 1485.12 | 495 | 353.474 | 328.432 | 156.391 | 297.28 | 238.483 | 151.2 | 660.577 |
| 293 | 346.1 | 476.411 | 570.336 | 287.547 | 325.5 | 1485.12 | 495 | 353.474 | 328.432 | 156.391 | 297.28 | 238.483 | 151.2 | 660.577 |
| 294 | 346.1 | 476.411 | 570.336 | 287.547 | 325.5 | 1485.12 | 495 | 353.474 | 328.432 | 156.391 | 297.28 | 238.483 | 151.2 | 660.577 |
| 295 | 346.1 | 476.411 | 570.336 | 287.547 | 325.5 | 1485.12 | 495 | 353.474 | 328.432 | 156.391 | 297.28 | 238.483 | 151.2 | 660.577 |
| 296 | 346.095 | 476.411 | 570.336 | 287.547 | 325.5 | 1485.12 | 495 | 353.474 | 328.432 | 156.391 | 297.28 | 238.483 | 151.2 | 660.577 |
| 297 | 346.095 | 476.411 | 570.336 | 287.547 | 325.5 | 1485.12 | 495 | 353.474 | 328.432 | 156.391 | 297.28 | 238.483 | 151.2 | 660.577 |
| 298 | 346.095 | 476.411 | 570.336 | 287.547 | 325.5 | 1485.12 | 495 | 353.474 | 328.432 | 156.391 | 297.28 | 238.483 | 151.2 | 660.577 |
| 299 | 346.09 | 476.411 | 570.336 | 287.547 | 325.5 | 1485.12 | 495 | 353.474 | 328.432 | 156.391 | 297.28 | 238.483 | 151.2 | 660.577 |
| 300 | 346.09 | 476.411 | 570.336 | 287.547 | 325.5 | 1485.12 | 495 | 353.474 | 328.432 | 156.391 | 297.28 | 238.483 | 151.2 | 660.577 |
| 301 | 346.09 | 476.411 | 570.336 | 287.547 | 325.5 | 1485.12 | 495 | 353.474 | 328.432 | 156.391 | 297.28 | 238.483 | 151.2 | 660.577 |
| 302 | 346.09 | 476.411 | 570.336 | 287.547 | 325.5 | 1485.12 | 495 | 353.474 | 328.432 | 156.391 | 297.28 | 238.483 | 151.2 | 660.577 |
| 303 | 346.085 | 476.411 | 570.336 | 287.547 | 325.5 | 1485.12 | 495 | 353.474 | 328.432 | 156.391 | 297.28 | 238.483 | 151.2 | 660.577 |
| 304 | 346.085 | 476.411 | 570.336 | 287.547 | 325.5 | 1485.12 | 495 | 353.474 | 328.432 | 156.391 | 297.28 | 238.483 | 151.2 | 660.577 |
| 305 | 346.085 | 476.411 | 570.336 | 287.547 | 325.5 | 1485.12 | 495 | 353.474 | 328.432 | 156.391 | 297.28 | 238.483 | 151.2 | 660.577 |
| 306 | 346.085 | 476.411 | 570.336 | 287.547 | 325.5 | 1485.12 | 495 | 353.474 | 328.432 | 156.391 | 297.28 | 238.483 | 151.2 | 660.577 |
| 307 | 346.081 | 476.411 | 570.336 | 287.547 | 325.5 | 1485.12 | 495 | 353.474 | 328.432 | 156.391 | 297.28 | 238.483 | 151.2 | 660.577 |
| 308 | 346.081 | 476.411 | 570.336 | 287.547 | 325.5 | 1485.12 | 495 | 353.474 | 328.432 | 156.391 | 297.28 | 238.483 | 151.2 | 660.577 |
| 309 | 346.081 | 476.411 | 570.336 | 287.547 | 325.5 | 1485.12 | 495 | 353.474 | 328.432 | 156.391 | 297.28 | 238.483 | 151.2 | 660.577 |
| 310 | 346.076 | 476.411 | 570.336 | 287.547 | 325.5 | 1485.12 | 495 | 353.474 | 328.432 | 156.391 | 297.28 | 238.483 | 151.2 | 660.577 |
| 311 | 346.076 | 476.411 | 570.336 | 287.547 | 325.5 | 1485.12 | 495 | 353.474 | 328.432 | 156.391 | 297.28 | 238.483 | 151.2 | 660.577 |
| 312 | 346.076 | 476.411 | 570.336 | 287.547 | 325.5 | 1485.12 | 495 | 353.474 | 328.432 | 156.391 | 297.28 | 238.483 | 151.2 | 660.577 |
| 313 | 346.076 | 476.411 | 570.336 | 287.547 | 325.5 | 1485.12 | 495 | 353.474 | 328.432 | 156.391 | 297.28 | 238.483 | 151.2 | 660.577 |
| 314 | 346.071 | 476.411 | 570.336 | 287.547 | 325.5 | 1485.12 | 495 | 353.474 | 328.432 | 156.391 | 297.28 | 238.483 | 151.2 | 660.577 |
| 315 | 346.071 | 476.411 | 570.336 | 287.547 | 325.5 | 1485.12 | 495 | 353.474 | 328.432 | 156.391 | 297.28 | 238.483 | 151.2 | 660.577 |
| 316 | 346.071 | 476.411 | 570.336 | 287.547 | 325.5 | 1485.12 | 495 | 353.474 | 328.432 | 156.391 | 297.28 | 238.483 | 151.2 | 660.577 |
| 317 | 346.071 | 476.411 | 570.336 | 287.547 | 325.5 | 1485.12 | 495 | 353.474 | 328.432 | 156.391 | 297.28 | 238.483 | 151.2 | 660.577 |
| 318 | 346.066 | 476.411 | 570.336 | 287.547 | 325.5 | 1485.12 | 495 | 353.474 | 328.432 | 156.391 | 297.28 | 238.483 | 151.2 | 660.577 |
| 319 | 346.066 | 476.411 | 570.336 | 287.547 | 325.5 | 1485.12 | 495 | 353.474 | 328.432 | 156.391 | 297.28 | 238.483 | 151.2 | 660.577 |
| 320 | 346.066 | 476.411 | 570.336 | 287.547 | 325.5 | 1485.12 | 495 | 353.474 | 328.432 | 156.391 | 297.28 | 238.483 | 151.2 | 660.577 |
| 321 | 346.066 | 476.411 | 570.336 | 287.547 | 325.5 | 1485.12 | 495 | 353.474 | 328.432 | 156.391 | 297.28 | 238.483 | 151.2 | 660.577 |
| 322 | 346.061 | 476.411 | 570.336 | 287.547 | 325.5 | 1485.12 | 495 | 353.474 | 328.432 | 156.391 | 297.28 | 238.483 | 151.2 | 660.577 |
| 323 | 346.061 | 476.411 | 570.336 | 287.547 | 325.5 | 1485.12 | 495 | 353.474 | 328.432 | 156.391 | 297.28 | 238.483 | 151.2 | 660.577 |
| 324 | 346.061 | 476.411 | 570.336 | 287.547 | 325.5 | 1485.12 | 495 | 353.474 | 328.432 | 156.391 | 297.28 | 238.483 | 151.2 | 660.577 |
| 325 | 346.061 | 476.411 | 570.336 | 287.547 | 325.5 | 1485.12 | 495 | 353.474 | 328.432 | 156.391 | 297.28 | 238.483 | 151.2 | 660.577 |
| 326 | 346.056 | 476.411 | 570.336 | 287.547 | 325.5 | 1485.12 | 495 | 353.474 | 328.432 | 156.391 | 297.28 | 238.483 | 151.2 | 660.577 |
| 327 | 346.056 | 476.411 | 570.336 | 287.547 | 325.5 | 1485.12 | 495 | 353.474 | 328.432 | 156.391 | 297.28 | 238.483 | 151.2 | 660.577 |
| 328 | 346.056 | 476.411 | 570.336 | 287.547 | 325.5 | 1485.12 | 495 | 353.474 | 328.432 | 156.391 | 297.28 | 238.483 | 151.2 | 660.577 |
| 329 | 346.056 | 476.411 | 570.336 | 287.547 | 325.5 | 1485.12 | 495 | 353.474 | 328.432 | 156.391 | 297.28 | 238.483 | 151.2 | 660.577 |
| 330 | 346.051 | 476.411 | 570.336 | 287.547 | 325.5 | 1485.12 | 495 | 353.474 | 328.432 | 156.391 | 297.28 | 238.483 | 151.2 | 660.577 |
| 331 | 346.051 | 476.411 | 570.336 | 287.547 | 325.5 | 1485.12 | 495 | 353.474 | 328.432 | 156.391 | 297.28 | 238.483 | 151.2 | 660.577 |
| 332 | 346.051 | 476.411 | 570.336 | 287.547 | 325.5 | 1485.12 | 495 | 353.474 | 328.432 | 156.391 | 297.28 | 238.483 | 151.2 | 660.577 |
| 333 | 346.051 | 476.411 | 570.336 | 287.547 | 325.5 | 1485.12 | 495 | 353.474 | 328.432 | 156.391 | 297.28 | 238.483 | 151.2 | 660.577 |
| 334 | 346.046 | 476.411 | 570.336 | 287.547 | 325.5 | 1485.12 | 495 | 353.474 | 328.432 | 156.391 | 297.28 | 238.483 | 151.2 | 660.577 |
| 335 | 346.046 | 476.411 | 570.336 | 287.547 | 325.5 | 1485.12 | 495 | 353.474 | 328.432 | 156.391 | 297.28 | 238.483 | 151.2 | 660.577 |
| 336 | 346.046 | 476.411 | 570.336 | 287.547 | 325.5 | 1485.12 | 495 | 353.474 | 328.432 | 156.391 | 297.28 | 238.483 | 151.2 | 660.577 |
| 337 | 346.046 | 476.411 | 570.336 | 287.547 | 325.5 | 1485.12 | 495 | 353.474 | 328.432 | 156.391 | 297.28 | 238.483 | 151.2 | 660.577 |
| 338 | 346.041 | 476.411 | 570.336 | 287.547 | 325.5 | 1485.12 | 495 | 353.474 | 328.432 | 156.391 | 297.28 | 238.483 | 151.2 | 660.577 |
| 339 | 346.041 | 476.411 | 570.336 | 287.547 | 325.5 | 1485.12 | 495 | 353.474 | 328.432 | 156.391 | 297.28 | 238.483 | 151.2 | 660.577 |
| 340 | 346.041 | 476.411 | 570.336 | 287.547 | 325.5 | 1485.12 | 495 | 353.474 | 328.432 | 156.391 | 297.28 | 238.483 | 151.2 | 660.577 |
| 341 | 346.041 | 476.411 | 570.336 | 287.547 | 325.5 | 1485.12 | 495 | 353.474 | 328.432 | 156.391 | 297.28 | 238.483 | 151.2 | 660.577 |
| 342 | 346.037 | 476.411 | 570.336 | 287.547 | 325.5 | 1485.12 | 495 | 353.474 | 328.432 | 156.391 | 297.28 | 238.483 | 151.2 | 660.577 |
| 343 | 346.037 | 476.411 | 570.336 | 287.547 | 325.5 | 1485.12 | 495 | 353.474 | 328.432 | 156.391 | 297.28 | 238.483 | 151.2 | 660.577 |
| 344 | 346.037 | 476.411 | 570.336 | 287.547 | 325.5 | 1485.12 | 495 | 353.474 | 328.432 | 156.391 | 297.28 | 238.483 | 151.2 | 660.577 |
| 345 | 346.037 | 476.411 | 570.336 | 287.547 | 325.5 | 1485.12 | 495 | 353.474 | 328.432 | 156.391 | 297.28 | 238.483 | 151.2 | 660.577 |
| 346 | 346.032 | 476.411 | 570.336 | 287.547 | 325.5 | 1485.12 | 495 | 353.474 | 328.432 | 156.391 | 297.28 | 238.483 | 151.2 | 660.577 |
| 347 | 346.032 | 476.411 | 570.336 | 287.547 | 325.5 | 1485.12 | 495 | 353.474 | 328.432 | 156.391 | 297.28 | 238.483 | 151.2 | 660.577 |
| 348 | 346.032 | 476.411 | 570.336 | 287.547 | 325.5 | 1485.12 | 495 | 353.474 | 328.432 | 156.391 | 297.28 | 238.483 | 151.2 | 660.577 |
| 349 | 346.032 | 476.411 | 570.336 | 287.547 | 325.5 | 1485.12 | 495 | 353.474 | 328.432 | 156.391 | 297.28 | 238.483 | 151.2 | 660.577 |
| 350 | 346.027 | 476.411 | 570.336 | 287.547 | 325.5 | 1485.12 | 495 | 353.474 | 328.432 | 156.391 | 297.28 | 238.483 | 151.2 | 660.577 |
| 351 | 346.027 | 476.411 | 570.336 | 287.547 | 325.5 | 1485.12 | 495 | 353.474 | 328.432 | 156.391 | 297.28 | 238.483 | 151.2 | 660.577 |
| 352 | 346.027 | 476.411 | 570.336 | 287.547 | 325.5 | 1485.12 | 495 | 353.474 | 328.432 | 156.391 | 297.28 | 238.483 | 151.2 | 660.577 |
| 353 | 346.027 | 476.411 | 570.336 | 287.547 | 325.5 | 1485.12 | 495 | 353.474 | 328.432 | 156.391 | 297.28 | 238.483 | 151.2 | 660.577 |
| 354 | 346.027 | 476.411 | 570.336 | 287.547 | 325.5 | 1485.12 | 495 | 353.474 | 328.432 | 156.391 | 297.28 | 238.483 | 151.2 | 660.577 |
| 355 | 346.022 | 476.411 | 570.336 | 287.547 | 325.5 | 1485.12 | 495 | 353.474 | 328.432 | 156.391 | 297.28 | 238.483 | 151.2 | 660.577 |
| 356 | 346.022 | 476.411 | 570.336 | 287.547 | 325.5 | 1485.12 | 495 | 353.474 | 328.432 | 156.391 | 297.28 | 238.483 | 151.2 | 660.577 |
| 357 | 346.022 | 476.411 | 570.336 | 287.547 | 325.5 | 1485.12 | 495 | 353.474 | 328.432 | 156.391 | 297.28 | 238.483 | 151.2 | 660.577 |
| 358 | 346.022 | 476.411 | 570.336 | 287.547 | 325.5 | 1485.12 | 495 | 353.474 | 328.432 | 156.391 | 297.28 | 238.483 | 151.2 | 660.577 |
| 359 | 346.017 | 476.411 | 570.336 | 287.547 | 325.5 | 1485.12 | 495 | 353.474 | 328.432 | 156.391 | 297.28 | 238.483 | 151.2 | 660.577 |
| 360 | 346.017 | 476.411 | 570.336 | 287.547 | 325.5 | 1485.12 | 495 | 353.474 | 328.432 | 156.391 | 297.28 | 238.483 | 151.2 | 660.577 |
| 361 | 346.017 | 476.411 | 570.336 | 287.547 | 325.5 | 1485.12 | 495 | 353.474 | 328.432 | 156.391 | 297.28 | 238.483 | 151.2 | 660.577 |
| 362 | 346.017 | 476.411 | 570.336 | 287.547 | 325.5 | 1485.12 | 495 | 353.474 | 328.432 | 156.391 | 297.28 | 238.483 | 151.2 | 660.577 |
| 363 | 346.012 | 476.411 | 570.336 | 287.547 | 325.5 | 1485.12 | 495 | 353.474 | 328.432 | 156.391 | 297.28 | 238.483 | 151.2 | 660.577 |
| 364 | 346.012 | 476.411 | 570.336 | 287.547 | 325.5 | 1485.12 | 495 | 353.474 | 328.432 | 156.391 | 297.28 | 238.483 | 151.2 | 660.577 |
| 365 | 346.012 | 476.411 | 570.336 | 287.547 | 325.5 | 1485.12 | 495 | 353.474 | 328.432 | 156.391 | 297.28 | 238.483 | 151.2 | 660.577 |
| 366 | 346.012 | 476.411 | 570.336 | 287.547 | 325.5 | 1485.12 | 495 | 353.474 | 328.432 | 156.391 | 297.28 | 238.483 | 151.2 | 660.577 |
| 367 | 346.012 | 476.411 | 570.336 | 287.547 | 325.5 | 1485.12 | 495 | 353.474 | 328.432 | 156.391 | 297.28 | 238.483 | 151.2 | 660.577 |
| 368 | 346.007 | 476.411 | 570.336 | 287.547 | 325.5 | 1485.12 | 495 | 353.474 | 328.432 | 156.391 | 297.28 | 238.483 | 151.2 | 660.577 |
| 369 | 346.007 | 476.411 | 570.336 | 287.547 | 325.5 | 1485.12 | 495 | 353.474 | 328.432 | 156.391 | 297.28 | 238.483 | 151.2 | 660.577 |
| 370 | 346.007 | 476.411 | 570.336 | 287.547 | 325.5 | 1485.12 | 495 | 353.474 | 328.432 | 156.391 | 297.28 | 238.483 | 151.2 | 660.577 |
| 371 | 346.007 | 476.411 | 570.336 | 287.547 | 325.5 | 1485.12 | 495 | 353.474 | 328.432 | 156.391 | 297.28 | 238.483 | 151.2 | 660.577 |
| 372 | 346.002 | 476.411 | 570.336 | 287.547 | 325.5 | 1485.12 | 495 | 353.474 | 328.432 | 156.391 | 297.28 | 238.483 | 151.2 | 660.577 |
| 373 | 346.002 | 476.411 | 570.336 | 287.547 | 325.5 | 1485.12 | 495 | 353.474 | 328.432 | 156.391 | 297.28 | 238.483 | 151.2 | 660.577 |
| 374 | 346.002 | 476.411 | 570.336 | 287.547 | 325.5 | 1485.12 | 495 | 353.474 | 328.432 | 156.391 | 297.28 | 238.483 | 151.2 | 660.577 |
| 375 | 346.002 | 476.411 | 570.336 | 287.547 | 325.5 | 1485.12 | 495 | 353.474 | 328.432 | 156.391 | 297.28 | 238.483 | 151.2 | 660.577 |
| 376 | 346.002 | 476.411 | 570.336 | 287.547 | 325.5 | 1485.12 | 495 | 353.474 | 328.432 | 156.391 | 297.28 | 238.483 | 151.2 | 660.577 |
| 377 | 345.998 | 476.411 | 570.336 | 287.547 | 325.5 | 1485.12 | 495 | 353.474 | 328.432 | 156.391 | 297.28 | 238.483 | 151.2 | 660.577 |
| 378 | 345.998 | 476.411 | 570.336 | 287.547 | 325.5 | 1485.12 | 495 | 353.474 | 328.432 | 156.391 | 297.28 | 238.483 | 151.2 | 660.577 |
| 379 | 345.998 | 476.411 | 570.336 | 287.547 | 325.5 | 1485.12 | 495 | 353.474 | 328.432 | 156.391 | 297.28 | 238.483 | 151.2 | 660.577 |
| 380 | 345.998 | 476.411 | 570.336 | 287.547 | 325.5 | 1485.12 | 495 | 353.474 | 328.432 | 156.391 | 297.28 | 238.483 | 151.2 | 660.577 |
| 381 | 345.998 | 476.411 | 570.336 | 287.547 | 325.5 | 1485.12 | 495 | 353.474 | 328.432 | 156.391 | 297.28 | 238.483 | 151.2 | 660.577 |
| 382 | 345.993 | 476.411 | 570.336 | 287.547 | 325.5 | 1485.12 | 495 | 353.474 | 328.432 | 156.391 | 297.28 | 238.483 | 151.2 | 660.577 |
| 383 | 345.993 | 476.411 | 570.336 | 287.547 | 325.5 | 1485.12 | 495 | 353.474 | 328.432 | 156.391 | 297.28 | 238.483 | 151.2 | 660.577 |
| 384 | 345.993 | 476.411 | 570.336 | 287.547 | 325.5 | 1485.12 | 495 | 353.474 | 328.432 | 156.391 | 297.28 | 238.483 | 151.2 | 660.577 |
| 385 | 345.993 | 476.411 | 570.336 | 287.547 | 325.5 | 1485.12 | 495 | 353.474 | 328.432 | 156.391 | 297.28 | 238.483 | 151.2 | 660.577 |
| 386 | 345.988 | 476.411 | 570.336 | 287.547 | 325.5 | 1485.12 | 495 | 353.474 | 328.432 | 156.391 | 297.28 | 238.483 | 151.2 | 660.577 |
| 387 | 345.988 | 476.411 | 570.336 | 287.547 | 325.5 | 1485.12 | 495 | 353.474 | 328.432 | 156.391 | 297.28 | 238.483 | 151.2 | 660.577 |
| 388 | 345.988 | 476.411 | 570.336 | 287.547 | 325.5 | 1485.12 | 495 | 353.474 | 328.432 | 156.391 | 297.28 | 238.483 | 151.2 | 660.577 |
| 389 | 345.988 | 476.411 | 570.336 | 287.547 | 325.5 | 1485.12 | 495 | 353.474 | 328.432 | 156.391 | 297.28 | 238.483 | 151.2 | 660.577 |
| 390 | 345.988 | 476.411 | 570.336 | 287.547 | 325.5 | 1485.12 | 495 | 353.474 | 328.432 | 156.391 | 297.28 | 238.483 | 151.2 | 660.577 |
| 391 | 345.983 | 476.411 | 570.336 | 287.547 | 325.5 | 1485.12 | 495 | 353.474 | 328.432 | 156.391 | 297.28 | 238.483 | 151.2 | 660.577 |
| 392 | 345.983 | 476.411 | 570.336 | 287.547 | 325.5 | 1485.12 | 495 | 353.474 | 328.432 | 156.391 | 297.28 | 238.483 | 151.2 | 660.577 |
| 393 | 345.983 | 476.411 | 570.336 | 287.547 | 325.5 | 1485.12 | 495 | 353.474 | 328.432 | 156.391 | 297.28 | 238.483 | 151.2 | 660.577 |
| 394 | 345.983 | 476.411 | 570.336 | 287.547 | 325.5 | 1485.12 | 495 | 353.474 | 328.432 | 156.391 | 297.28 | 238.483 | 151.2 | 660.577 |
| 395 | 345.983 | 476.411 | 570.336 | 287.547 | 325.5 | 1485.12 | 495 | 353.474 | 328.432 | 156.391 | 297.28 | 238.483 | 151.2 | 660.577 |
| 396 | 345.978 | 476.411 | 570.336 | 287.547 | 325.5 | 1485.12 | 495 | 353.474 | 328.432 | 156.391 | 297.28 | 238.483 | 151.2 | 660.577 |
| 397 | 345.978 | 476.411 | 570.336 | 287.547 | 325.5 | 1485.12 | 495 | 353.474 | 328.432 | 156.391 | 297.28 | 238.483 | 151.2 | 660.577 |
| 398 | 345.978 | 476.411 | 570.336 | 287.547 | 325.5 | 1485.12 | 495 | 353.474 | 328.432 | 156.391 | 297.28 | 238.483 | 151.2 | 660.577 |
| 399 | 345.978 | 476.411 | 570.336 | 287.547 | 325.5 | 1485.12 | 495 | 353.474 | 328.432 | 156.391 | 297.28 | 238.483 | 151.2 | 660.577 |
| 400 | 345.978 | 476.411 | 570.336 | 287.547 | 325.5 | 1485.12 | 495 | 353.474 | 328.432 | 156.391 | 297.28 | 238.483 | 151.2 | 660.577 |
| 401 | 345.973 | 476.411 | 570.336 | 287.547 | 325.5 | 1485.12 | 495 | 353.474 | 328.432 | 156.391 | 297.28 | 238.483 | 151.2 | 660.577 |
| 402 | 345.973 | 476.411 | 570.336 | 287.547 | 325.5 | 1485.12 | 495 | 353.474 | 328.432 | 156.391 | 297.28 | 238.483 | 151.2 | 660.577 |
| 403 | 345.973 | 476.411 | 570.336 | 287.547 | 325.5 | 1485.12 | 495 | 353.474 | 328.432 | 156.391 | 297.28 | 238.483 | 151.2 | 660.577 |
| 404 | 345.973 | 476.411 | 570.336 | 287.547 | 325.5 | 1485.12 | 495 | 353.474 | 328.432 | 156.391 | 297.28 | 238.483 | 151.2 | 660.577 |
| 405 | 345.968 | 476.411 | 570.336 | 287.547 | 325.5 | 1485.12 | 495 | 353.474 | 328.432 | 156.391 | 297.28 | 238.483 | 151.2 | 660.577 |
| 406 | 345.968 | 476.411 | 570.336 | 287.547 | 325.5 | 1485.12 | 495 | 353.474 | 328.432 | 156.391 | 297.28 | 238.483 | 151.2 | 660.577 |
| 407 | 345.968 | 476.411 | 570.336 | 287.547 | 325.5 | 1485.12 | 495 | 353.474 | 328.432 | 156.391 | 297.28 | 238.483 | 151.2 | 660.577 |
| 408 | 345.968 | 476.411 | 570.336 | 287.547 | 325.5 | 1485.12 | 495 | 353.474 | 328.432 | 156.391 | 297.28 | 238.483 | 151.2 | 660.577 |
| 409 | 345.968 | 476.411 | 570.336 | 287.547 | 325.5 | 1485.12 | 495 | 353.474 | 328.432 | 156.391 | 297.28 | 238.483 | 151.2 | 660.577 |
| 410 | 345.963 | 476.411 | 570.336 | 287.547 | 325.5 | 1485.12 | 495 | 353.474 | 328.432 | 156.391 | 297.28 | 238.483 | 151.2 | 660.577 |
| 411 | 345.963 | 476.411 | 570.336 | 287.547 | 325.5 | 1485.12 | 495 | 353.474 | 328.432 | 156.391 | 297.28 | 238.483 | 151.2 | 660.577 |
| 412 | 345.963 | 476.411 | 570.336 | 287.547 | 325.5 | 1485.12 | 495 | 353.474 | 328.432 | 156.391 | 297.28 | 238.483 | 151.2 | 660.577 |
| 413 | 345.963 | 476.411 | 570.336 | 287.547 | 325.5 | 1485.12 | 495 | 353.474 | 328.432 | 156.391 | 297.28 | 238.483 | 151.2 | 660.577 |
| 414 | 345.963 | 476.411 | 570.336 | 287.547 | 325.5 | 1485.12 | 495 | 353.474 | 328.432 | 156.391 | 297.28 | 238.483 | 151.2 | 660.577 |
| 415 | 345.958 | 476.411 | 570.336 | 287.547 | 325.5 | 1485.12 | 495 | 353.474 | 328.432 | 156.391 | 297.28 | 238.483 | 151.2 | 660.577 |
| 416 | 345.958 | 476.411 | 570.336 | 287.547 | 325.5 | 1485.12 | 495 | 353.474 | 328.432 | 156.391 | 297.28 | 238.483 | 151.2 | 660.577 |
| 417 | 345.958 | 476.411 | 570.336 | 287.547 | 325.5 | 1485.12 | 495 | 353.474 | 328.432 | 156.391 | 297.28 | 238.483 | 151.2 | 660.577 |
| 418 | 345.958 | 476.411 | 570.336 | 287.547 | 325.5 | 1485.12 | 495 | 353.474 | 328.432 | 156.391 | 297.28 | 238.483 | 151.2 | 660.577 |
| 419 | 345.958 | 476.411 | 570.336 | 287.547 | 325.5 | 1485.12 | 495 | 353.474 | 328.432 | 156.391 | 297.28 | 238.483 | 151.2 | 660.577 |
| 420 | 345.958 | 476.411 | 570.336 | 287.547 | 325.5 | 1485.12 | 495 | 353.474 | 328.432 | 156.391 | 297.28 | 238.483 | 151.2 | 660.577 |
| 421 | 345.954 | 476.411 | 570.336 | 287.547 | 325.5 | 1485.12 | 495 | 353.474 | 328.432 | 156.391 | 297.28 | 238.483 | 151.2 | 660.577 |
| 422 | 345.954 | 476.411 | 570.336 | 287.547 | 325.5 | 1485.12 | 495 | 353.474 | 328.432 | 156.391 | 297.28 | 238.483 | 151.2 | 660.577 |
| 423 | 345.954 | 476.411 | 570.336 | 287.547 | 325.5 | 1485.12 | 495 | 353.474 | 328.432 | 156.391 | 297.28 | 238.483 | 151.2 | 660.577 |
| 424 | 345.954 | 476.411 | 570.336 | 287.547 | 325.5 | 1485.12 | 495 | 353.474 | 328.432 | 156.391 | 297.28 | 238.483 | 151.2 | 660.577 |
| 425 | 345.954 | 476.411 | 570.336 | 287.547 | 325.5 | 1485.12 | 495 | 353.474 | 328.432 | 156.391 | 297.28 | 238.483 | 151.2 | 660.577 |
| 426 | 345.949 | 476.411 | 570.336 | 287.547 | 325.5 | 1485.12 | 495 | 353.474 | 328.432 | 156.391 | 297.28 | 238.483 | 151.2 | 660.577 |
| 427 | 345.949 | 476.411 | 570.336 | 287.547 | 325.5 | 1485.12 | 495 | 353.474 | 328.432 | 156.391 | 297.28 | 238.483 | 151.2 | 660.577 |
| 428 | 345.949 | 476.411 | 570.336 | 287.547 | 325.5 | 1485.12 | 495 | 353.474 | 328.432 | 156.391 | 297.28 | 238.483 | 151.2 | 660.577 |
| 429 | 345.949 | 476.411 | 570.336 | 287.547 | 325.5 | 1485.12 | 495 | 353.474 | 328.432 | 156.391 | 297.28 | 238.483 | 151.2 | 660.577 |
| 430 | 345.949 | 476.411 | 570.336 | 287.547 | 325.5 | 1485.12 | 495 | 353.474 | 328.432 | 156.391 | 297.28 | 238.483 | 151.2 | 660.577 |
| 431 | 345.944 | 476.411 | 570.336 | 287.547 | 325.5 | 1485.12 | 495 | 353.474 | 328.432 | 156.391 | 297.28 | 238.483 | 151.2 | 660.577 |
| 432 | 345.944 | 476.411 | 570.336 | 287.547 | 325.5 | 1485.12 | 495 | 353.474 | 328.432 | 156.391 | 297.28 | 238.483 | 151.2 | 660.577 |
| 433 | 345.944 | 476.411 | 570.336 | 287.547 | 325.5 | 1485.12 | 495 | 353.474 | 328.432 | 156.391 | 297.28 | 238.483 | 151.2 | 660.577 |
| 434 | 345.944 | 476.411 | 570.336 | 287.547 | 325.5 | 1485.12 | 495 | 353.474 | 328.432 | 156.391 | 297.28 | 238.483 | 151.2 | 660.577 |
| 435 | 345.944 | 476.411 | 570.336 | 287.547 | 325.5 | 1485.12 | 495 | 353.474 | 328.432 | 156.391 | 297.28 | 238.483 | 151.2 | 660.577 |
| 436 | 345.939 | 476.411 | 570.336 | 287.547 | 325.5 | 1485.12 | 495 | 353.474 | 328.432 | 156.391 | 297.28 | 238.483 | 151.2 | 660.577 |
| 437 | 345.939 | 476.411 | 570.336 | 287.547 | 325.5 | 1485.12 | 495 | 353.474 | 328.432 | 156.391 | 297.28 | 238.483 | 151.2 | 660.577 |
| 438 | 345.939 | 476.411 | 570.336 | 287.547 | 325.5 | 1485.12 | 495 | 353.474 | 328.432 | 156.391 | 297.28 | 238.483 | 151.2 | 660.577 |
| 439 | 345.939 | 476.411 | 570.336 | 287.547 | 325.5 | 1485.12 | 495 | 353.474 | 328.432 | 156.391 | 297.28 | 238.483 | 151.2 | 660.577 |
| 440 | 345.939 | 476.411 | 570.336 | 287.547 | 325.5 | 1485.12 | 495 | 353.474 | 328.432 | 156.391 | 297.28 | 238.483 | 151.2 | 660.577 |
| 441 | 345.939 | 476.411 | 570.336 | 287.547 | 325.5 | 1485.12 | 495 | 353.474 | 328.432 | 156.391 | 297.28 | 238.483 | 151.2 | 660.577 |
| 442 | 345.934 | 476.411 | 570.336 | 287.547 | 325.5 | 1485.12 | 495 | 353.474 | 328.432 | 156.391 | 297.28 | 238.483 | 151.2 | 660.577 |
| 443 | 345.934 | 476.411 | 570.336 | 287.547 | 325.5 | 1485.12 | 495 | 353.474 | 328.432 | 156.391 | 297.28 | 238.483 | 151.2 | 660.577 |
| 444 | 345.934 | 476.411 | 570.336 | 287.547 | 325.5 | 1485.12 | 495 | 353.474 | 328.432 | 156.391 | 297.28 | 238.483 | 151.2 | 660.577 |
| 445 | 345.934 | 476.411 | 570.336 | 287.547 | 325.5 | 1485.12 | 495 | 353.474 | 328.432 | 156.391 | 297.28 | 238.483 | 151.2 | 660.577 |
| 446 | 345.934 | 476.411 | 570.336 | 287.547 | 325.5 | 1485.12 | 495 | 353.474 | 328.432 | 156.391 | 297.28 | 238.483 | 151.2 | 660.577 |
| 447 | 345.929 | 476.411 | 570.336 | 287.547 | 325.5 | 1485.12 | 495 | 353.474 | 328.432 | 156.391 | 297.28 | 238.483 | 151.2 | 660.577 |
| 448 | 345.929 | 476.411 | 570.336 | 287.547 | 325.5 | 1485.12 | 495 | 353.474 | 328.432 | 156.391 | 297.28 | 238.483 | 151.2 | 660.577 |
| 449 | 345.929 | 476.411 | 570.336 | 287.547 | 325.5 | 1485.12 | 495 | 353.474 | 328.432 | 156.391 | 297.28 | 238.483 | 151.2 | 660.577 |
| 450 | 345.929 | 476.411 | 570.336 | 287.547 | 325.5 | 1485.12 | 495 | 353.474 | 328.432 | 156.391 | 297.28 | 238.483 | 151.2 | 660.577 |
| 451 | 345.929 | 476.411 | 570.336 | 287.547 | 325.5 | 1485.12 | 495 | 353.474 | 328.432 | 156.391 | 297.28 | 238.483 | 151.2 | 660.577 |
| 452 | 345.924 | 476.411 | 570.336 | 287.547 | 325.5 | 1485.12 | 495 | 353.474 | 328.432 | 156.391 | 297.28 | 238.483 | 151.2 | 660.577 |
| 453 | 345.924 | 476.411 | 570.336 | 287.547 | 325.5 | 1485.12 | 495 | 353.474 | 328.432 | 156.391 | 297.28 | 238.483 | 151.2 | 660.577 |
| 454 | 345.924 | 476.411 | 570.336 | 287.547 | 325.5 | 1485.12 | 495 | 353.474 | 328.432 | 156.391 | 297.28 | 238.483 | 151.2 | 660.577 |
| 455 | 345.924 | 476.411 | 570.336 | 287.547 | 325.5 | 1485.12 | 495 | 353.474 | 328.432 | 156.391 | 297.28 | 238.483 | 151.2 | 660.577 |
| 456 | 345.924 | 476.411 | 570.336 | 287.547 | 325.5 | 1485.12 | 495 | 353.474 | 328.432 | 156.391 | 297.28 | 238.483 | 151.2 | 660.577 |
| 457 | 345.924 | 476.411 | 570.336 | 287.547 | 325.5 | 1485.12 | 495 | 353.474 | 328.432 | 156.391 | 297.28 | 238.483 | 151.2 | 660.577 |
| 458 | 345.919 | 476.411 | 570.336 | 287.547 | 325.5 | 1485.12 | 495 | 353.474 | 328.432 | 156.391 | 297.28 | 238.483 | 151.2 | 660.577 |
| 459 | 345.919 | 476.411 | 570.336 | 287.547 | 325.5 | 1485.12 | 495 | 353.474 | 328.432 | 156.391 | 297.28 | 238.483 | 151.2 | 660.577 |
| 460 | 345.919 | 476.411 | 570.336 | 287.547 | 325.5 | 1485.12 | 495 | 353.474 | 328.432 | 156.391 | 297.28 | 238.483 | 151.2 | 660.577 |
| 461 | 345.919 | 476.411 | 570.336 | 287.547 | 325.5 | 1485.12 | 495 | 353.474 | 328.432 | 156.391 | 297.28 | 238.483 | 151.2 | 660.577 |
| 462 | 345.919 | 476.411 | 570.336 | 287.547 | 325.5 | 1485.12 | 495 | 353.474 | 328.432 | 156.391 | 297.28 | 238.483 | 151.2 | 660.577 |
| 463 | 345.919 | 476.411 | 570.336 | 287.547 | 325.5 | 1485.12 | 495 | 353.474 | 328.432 | 156.391 | 297.28 | 238.483 | 151.2 | 660.577 |
| 464 | 345.915 | 476.411 | 570.336 | 287.547 | 325.5 | 1485.12 | 495 | 353.474 | 328.432 | 156.391 | 297.28 | 238.483 | 151.2 | 660.577 |
| 465 | 345.915 | 476.411 | 570.336 | 287.547 | 325.5 | 1485.12 | 495 | 353.474 | 328.432 | 156.391 | 297.28 | 238.483 | 151.2 | 660.577 |
| 466 | 345.915 | 476.411 | 570.336 | 287.547 | 325.5 | 1485.12 | 495 | 353.474 | 328.432 | 156.391 | 297.28 | 238.483 | 151.2 | 660.577 |
| 467 | 345.915 | 476.411 | 570.336 | 287.547 | 325.5 | 1485.12 | 495 | 353.474 | 328.432 | 156.391 | 297.28 | 238.483 | 151.2 | 660.577 |
| 468 | 345.915 | 476.411 | 570.336 | 287.547 | 325.5 | 1485.12 | 495 | 353.474 | 328.432 | 156.391 | 297.28 | 238.483 | 151.2 | 660.577 |
| 469 | 345.91 | 476.411 | 570.336 | 287.547 | 325.5 | 1485.12 | 495 | 353.474 | 328.432 | 156.391 | 297.28 | 238.483 | 151.2 | 660.577 |
| 470 | 345.91 | 476.411 | 570.336 | 287.547 | 325.5 | 1485.12 | 495 | 353.474 | 328.432 | 156.391 | 297.28 | 238.483 | 151.2 | 660.577 |
| 471 | 345.91 | 476.411 | 570.336 | 287.547 | 325.5 | 1485.12 | 495 | 353.474 | 328.432 | 156.391 | 297.28 | 238.483 | 151.2 | 660.577 |
| 472 | 345.91 | 476.411 | 570.336 | 287.547 | 325.5 | 1485.12 | 495 | 353.474 | 328.432 | 156.391 | 297.28 | 238.483 | 151.2 | 660.577 |
| 473 | 345.91 | 476.411 | 570.336 | 287.547 | 325.5 | 1485.12 | 495 | 353.474 | 328.432 | 156.391 | 297.28 | 238.483 | 151.2 | 660.577 |
| 474 | 345.91 | 476.411 | 570.336 | 287.547 | 325.5 | 1485.12 | 495 | 353.474 | 328.432 | 156.391 | 297.28 | 238.483 | 151.2 | 660.577 |
| 475 | 345.905 | 476.411 | 570.336 | 287.547 | 325.5 | 1485.12 | 495 | 353.474 | 328.432 | 156.391 | 297.28 | 238.483 | 151.2 | 660.577 |
| 476 | 345.905 | 476.411 | 570.336 | 287.547 | 325.5 | 1485.12 | 495 | 353.474 | 328.432 | 156.391 | 297.28 | 238.483 | 151.2 | 660.577 |
| 477 | 345.905 | 476.411 | 570.336 | 287.547 | 325.5 | 1485.12 | 495 | 353.474 | 328.432 | 156.391 | 297.28 | 238.483 | 151.2 | 660.577 |
| 478 | 345.905 | 476.411 | 570.336 | 287.547 | 325.5 | 1485.12 | 495 | 353.474 | 328.432 | 156.391 | 297.28 | 238.483 | 151.2 | 660.577 |
| 479 | 345.905 | 476.411 | 570.336 | 287.547 | 325.5 | 1485.12 | 495 | 353.474 | 328.432 | 156.391 | 297.28 | 238.483 | 151.2 | 660.577 |
| 480 | 345.905 | 476.411 | 570.336 | 287.547 | 325.5 | 1485.12 | 495 | 353.474 | 328.432 | 156.391 | 297.28 | 238.483 | 151.2 | 660.577 |
| 481 | 345.9 | 476.411 | 570.336 | 287.547 | 325.5 | 1485.12 | 495 | 353.474 | 328.432 | 156.391 | 297.28 | 238.483 | 151.2 | 660.577 |
| 482 | 345.9 | 476.411 | 570.336 | 287.547 | 325.5 | 1485.12 | 495 | 353.474 | 328.432 | 156.391 | 297.28 | 238.483 | 151.2 | 660.577 |
| 483 | 345.9 | 476.411 | 570.336 | 287.547 | 325.5 | 1485.12 | 495 | 353.474 | 328.432 | 156.391 | 297.28 | 238.483 | 151.2 | 660.577 |
| 484 | 345.9 | 476.411 | 570.336 | 287.547 | 325.5 | 1485.12 | 495 | 353.474 | 328.432 | 156.391 | 297.28 | 238.483 | 151.2 | 660.577 |
| 485 | 345.9 | 476.411 | 570.336 | 287.547 | 325.5 | 1485.12 | 495 | 353.474 | 328.432 | 156.391 | 297.28 | 238.483 | 151.2 | 660.577 |
| 486 | 345.9 | 476.411 | 570.336 | 287.547 | 325.5 | 1485.12 | 495 | 353.474 | 328.432 | 156.391 | 297.28 | 238.483 | 151.2 | 660.577 |
| 487 | 345.895 | 476.411 | 570.336 | 287.547 | 325.5 | 1485.12 | 495 | 353.474 | 328.432 | 156.391 | 297.28 | 238.483 | 151.2 | 660.577 |
| 488 | 345.895 | 476.411 | 570.336 | 287.547 | 325.5 | 1485.12 | 495 | 353.474 | 328.432 | 156.391 | 297.28 | 238.483 | 151.2 | 660.577 |
| 489 | 345.895 | 476.411 | 570.336 | 287.547 | 325.5 | 1485.12 | 495 | 353.474 | 328.432 | 156.391 | 297.28 | 238.483 | 151.2 | 660.577 |
| 490 | 345.895 | 476.411 | 570.336 | 287.547 | 325.5 | 1485.12 | 495 | 353.474 | 328.432 | 156.391 | 297.28 | 238.483 | 151.2 | 660.577 |
| 491 | 345.895 | 476.411 | 570.336 | 287.547 | 325.5 | 1485.12 | 495 | 353.474 | 328.432 | 156.391 | 297.28 | 238.483 | 151.2 | 660.577 |
| 492 | 345.895 | 476.411 | 570.336 | 287.547 | 325.5 | 1485.12 | 495 | 353.474 | 328.432 | 156.391 | 297.28 | 238.483 | 151.2 | 660.577 |
| 493 | 345.89 | 476.411 | 570.336 | 287.547 | 325.5 | 1485.12 | 495 | 353.474 | 328.432 | 156.391 | 297.28 | 238.483 | 151.2 | 660.577 |
| 494 | 345.89 | 476.411 | 570.336 | 287.547 | 325.5 | 1485.12 | 495 | 353.474 | 328.432 | 156.391 | 297.28 | 238.483 | 151.2 | 660.577 |
| 495 | 345.89 | 476.411 | 570.336 | 287.547 | 325.5 | 1485.12 | 495 | 353.474 | 328.432 | 156.391 | 297.28 | 238.483 | 151.2 | 660.577 |
| 496 | 345.89 | 476.411 | 570.336 | 287.547 | 325.5 | 1485.12 | 495 | 353.474 | 328.432 | 156.391 | 297.28 | 238.483 | 151.2 | 660.577 |
| 497 | 345.89 | 476.411 | 570.336 | 287.547 | 325.5 | 1485.12 | 495 | 353.474 | 328.432 | 156.391 | 297.28 | 238.483 | 151.2 | 660.577 |
| 498 | 345.89 | 476.411 | 570.336 | 287.547 | 325.5 | 1485.12 | 495 | 353.474 | 328.432 | 156.391 | 297.28 | 238.483 | 151.2 | 660.577 |
| 499 | 345.885 | 476.411 | 570.336 | 287.547 | 325.5 | 1485.12 | 495 | 353.474 | 328.432 | 156.391 | 297.28 | 238.483 | 151.2 | 660.577 |
| 500 | 345.886 | 476.411 | 570.336 | 287.547 | 325.5 | 1485.12 | 495 | 353.474 | 328.432 | 156.391 | 297.28 | 238.483 | 151.2 | 660.577 |
| 501 | 345.885 | 476.411 | 570.336 | 287.547 | 325.5 | 1485.12 | 495 | 353.474 | 328.432 | 156.391 | 297.28 | 238.483 | 151.2 | 660.577 |
| 502 | 345.885 | 476.411 | 570.336 | 287.547 | 325.5 | 1485.12 | 495 | 353.474 | 328.432 | 156.391 | 297.28 | 238.483 | 151.2 | 660.577 |
| 503 | 345.884 | 476.411 | 570.336 | 287.547 | 325.5 | 1485.12 | 495 | 353.474 | 328.432 | 156.391 | 297.28 | 238.483 | 151.2 | 660.577 |
| 504 | 345.883 | 476.411 | 570.336 | 287.547 | 325.5 | 1485.12 | 495 | 353.474 | 328.432 | 156.391 | 297.28 | 238.483 | 151.2 | 660.577 |
| 505 | 345.882 | 476.411 | 570.336 | 287.547 | 325.5 | 1485.12 | 495 | 353.474 | 328.432 | 156.391 | 297.28 | 238.483 | 151.2 | 660.577 |
| 506 | 345.881 | 476.411 | 570.336 | 287.547 | 325.5 | 1485.12 | 495 | 353.474 | 328.432 | 156.391 | 297.28 | 238.483 | 151.2 | 660.577 |
| 507 | 345.881 | 476.411 | 570.336 | 287.547 | 325.5 | 1485.12 | 495 | 353.474 | 328.432 | 156.391 | 297.28 | 238.483 | 151.2 | 660.577 |
| 508 | 345.88 | 476.411 | 570.336 | 287.547 | 325.5 | 1485.12 | 495 | 353.474 | 328.432 | 156.391 | 297.28 | 238.483 | 151.2 | 660.577 |
| 509 | 345.879 | 476.411 | 570.336 | 287.547 | 325.5 | 1485.12 | 495 | 353.474 | 328.432 | 156.391 | 297.28 | 238.483 | 151.2 | 660.577 |
| 510 | 345.878 | 476.411 | 570.336 | 287.547 | 325.5 | 1485.12 | 495 | 353.474 | 328.432 | 156.391 | 297.28 | 238.483 | 151.2 | 660.577 |
| 511 | 345.877 | 476.411 | 570.336 | 287.547 | 325.5 | 1485.12 | 495 | 353.474 | 328.432 | 156.391 | 297.28 | 238.483 | 151.2 | 660.577 |
| 512 | 345.877 | 476.411 | 570.336 | 287.547 | 325.5 | 1485.12 | 495 | 353.474 | 328.432 | 156.391 | 297.28 | 238.483 | 151.2 | 660.577 |
| 513 | 345.876 | 476.411 | 570.336 | 287.547 | 325.5 | 1485.12 | 495 | 353.474 | 328.432 | 156.391 | 297.28 | 238.483 | 151.2 | 660.577 |
| 514 | 345.875 | 476.411 | 570.336 | 287.547 | 325.5 | 1485.12 | 495 | 353.474 | 328.432 | 156.391 | 297.28 | 238.483 | 151.2 | 660.577 |
| 515 | 345.874 | 476.411 | 570.336 | 287.547 | 325.5 | 1485.12 | 495 | 353.474 | 328.432 | 156.391 | 297.28 | 238.483 | 151.2 | 660.577 |
| 516 | 345.874 | 476.411 | 570.336 | 287.547 | 325.5 | 1485.12 | 495 | 353.474 | 328.432 | 156.391 | 297.28 | 238.483 | 151.2 | 660.577 |
| 517 | 345.873 | 476.411 | 570.336 | 287.547 | 325.5 | 1485.12 | 495 | 353.474 | 328.432 | 156.391 | 297.28 | 238.483 | 151.2 | 660.577 |
| 518 | 345.872 | 476.411 | 570.336 | 287.547 | 325.5 | 1485.12 | 495 | 353.474 | 328.432 | 156.391 | 297.28 | 238.483 | 151.2 | 660.577 |
| 519 | 345.871 | 476.411 | 570.336 | 287.547 | 325.5 | 1485.12 | 495 | 353.474 | 328.432 | 156.391 | 297.28 | 238.483 | 151.2 | 660.577 |
| 520 | 345.87 | 476.411 | 570.336 | 287.547 | 325.5 | 1485.12 | 495 | 353.474 | 328.432 | 156.391 | 297.28 | 238.483 | 151.2 | 660.577 |
| 521 | 345.87 | 476.411 | 570.336 | 287.547 | 325.5 | 1485.12 | 495 | 353.474 | 328.432 | 156.391 | 297.28 | 238.483 | 151.2 | 660.577 |
| 522 | 345.869 | 476.411 | 570.336 | 287.547 | 325.5 | 1485.12 | 495 | 353.474 | 328.432 | 156.391 | 297.28 | 238.483 | 151.2 | 660.577 |
| 523 | 345.868 | 476.411 | 570.336 | 287.547 | 325.5 | 1485.12 | 495 | 353.474 | 328.432 | 156.391 | 297.28 | 238.483 | 151.2 | 660.577 |
| 524 | 345.867 | 476.411 | 570.336 | 287.547 | 325.5 | 1485.12 | 495 | 353.474 | 328.432 | 156.391 | 297.28 | 238.483 | 151.2 | 660.577 |
| 525 | 345.867 | 476.411 | 570.336 | 287.547 | 325.5 | 1485.12 | 495 | 353.474 | 328.432 | 156.391 | 297.28 | 238.483 | 151.2 | 660.577 |
| 526 | 345.866 | 476.411 | 570.336 | 287.547 | 325.5 | 1485.12 | 495 | 353.474 | 328.432 | 156.391 | 297.28 | 238.483 | 151.2 | 660.577 |
| 527 | 345.865 | 476.411 | 570.336 | 287.547 | 325.5 | 1485.12 | 495 | 353.474 | 328.432 | 156.391 | 297.28 | 238.483 | 151.2 | 660.577 |
| 528 | 345.864 | 476.411 | 570.336 | 287.547 | 325.5 | 1485.12 | 495 | 353.474 | 328.432 | 156.391 | 297.28 | 238.483 | 151.2 | 660.577 |
| 529 | 345.864 | 476.411 | 570.336 | 287.547 | 325.5 | 1485.12 | 495 | 353.474 | 328.432 | 156.391 | 297.28 | 238.483 | 151.2 | 660.577 |
| 530 | 345.863 | 476.411 | 570.336 | 287.547 | 325.5 | 1485.12 | 495 | 353.474 | 328.432 | 156.391 | 297.28 | 238.483 | 151.2 | 660.577 |
| 531 | 345.862 | 476.411 | 570.336 | 287.547 | 325.5 | 1485.12 | 495 | 353.474 | 328.432 | 156.391 | 297.28 | 238.483 | 151.2 | 660.577 |
| 532 | 345.861 | 476.411 | 570.336 | 287.547 | 325.5 | 1485.12 | 495 | 353.474 | 328.432 | 156.391 | 297.28 | 238.483 | 151.2 | 660.577 |
| 533 | 345.861 | 476.411 | 570.336 | 287.547 | 325.5 | 1485.12 | 495 | 353.474 | 328.432 | 156.391 | 297.28 | 238.483 | 151.2 | 660.577 |
| 534 | 345.86 | 476.411 | 570.336 | 287.547 | 325.5 | 1485.12 | 495 | 353.474 | 328.432 | 156.391 | 297.28 | 238.483 | 151.2 | 660.577 |
| 535 | 345.859 | 476.411 | 570.336 | 287.547 | 325.5 | 1485.12 | 495 | 353.474 | 328.432 | 156.391 | 297.28 | 238.483 | 151.2 | 660.577 |
| 536 | 345.858 | 476.411 | 570.336 | 287.547 | 325.5 | 1485.12 | 495 | 353.474 | 328.432 | 156.391 | 297.28 | 238.483 | 151.2 | 660.577 |
| 537 | 345.858 | 476.411 | 570.336 | 287.547 | 325.5 | 1485.12 | 495 | 353.474 | 328.432 | 156.391 | 297.28 | 238.483 | 151.2 | 660.577 |
| 538 | 345.857 | 476.411 | 570.336 | 287.547 | 325.5 | 1485.12 | 495 | 353.474 | 328.432 | 156.391 | 297.28 | 238.483 | 151.2 | 660.577 |
| 539 | 345.856 | 476.411 | 570.336 | 287.547 | 325.5 | 1485.12 | 495 | 353.474 | 328.432 | 156.391 | 297.28 | 238.483 | 151.2 | 660.577 |
| 540 | 345.855 | 476.411 | 570.336 | 287.547 | 325.5 | 1485.12 | 495 | 353.474 | 328.432 | 156.391 | 297.28 | 238.483 | 151.2 | 660.577 |
| 541 | 345.855 | 476.411 | 570.336 | 287.547 | 325.5 | 1485.12 | 495 | 353.474 | 328.432 | 156.391 | 297.28 | 238.483 | 151.2 | 660.577 |
| 542 | 345.854 | 476.411 | 570.336 | 287.547 | 325.5 | 1485.12 | 495 | 353.474 | 328.432 | 156.391 | 297.28 | 238.483 | 151.2 | 660.577 |
| 543 | 345.853 | 476.411 | 570.336 | 287.547 | 325.5 | 1485.12 | 495 | 353.474 | 328.432 | 156.391 | 297.28 | 238.483 | 151.2 | 660.577 |
| 544 | 345.852 | 476.411 | 570.336 | 287.547 | 325.5 | 1485.12 | 495 | 353.474 | 328.432 | 156.391 | 297.28 | 238.483 | 151.2 | 660.577 |
| 545 | 345.852 | 476.411 | 570.336 | 287.547 | 325.5 | 1485.12 | 495 | 353.474 | 328.432 | 156.391 | 297.28 | 238.483 | 151.2 | 660.577 |
| 546 | 345.851 | 476.411 | 570.336 | 287.547 | 325.5 | 1485.12 | 495 | 353.474 | 328.432 | 156.391 | 297.28 | 238.483 | 151.2 | 660.577 |
| 547 | 345.85 | 476.411 | 570.336 | 287.547 | 325.5 | 1485.12 | 495 | 353.474 | 328.432 | 156.391 | 297.28 | 238.483 | 151.2 | 660.577 |
| 548 | 345.849 | 476.411 | 570.336 | 287.547 | 325.5 | 1485.12 | 495 | 353.474 | 328.432 | 156.391 | 297.28 | 238.483 | 151.2 | 660.577 |
| 549 | 345.849 | 476.411 | 570.336 | 287.547 | 325.5 | 1485.12 | 495 | 353.474 | 328.432 | 156.391 | 297.28 | 238.483 | 151.2 | 660.577 |
| 550 | 345.848 | 476.411 | 570.336 | 287.547 | 325.5 | 1485.12 | 495 | 353.474 | 328.432 | 156.391 | 297.28 | 238.483 | 151.2 | 660.577 |
| 551 | 345.847 | 476.411 | 570.336 | 287.547 | 325.5 | 1485.12 | 495 | 353.474 | 328.432 | 156.391 | 297.28 | 238.483 | 151.2 | 660.577 |
| 552 | 345.846 | 476.411 | 570.336 | 287.547 | 325.5 | 1485.12 | 495 | 353.474 | 328.432 | 156.391 | 297.28 | 238.483 | 151.2 | 660.577 |
| 553 | 345.846 | 476.411 | 570.336 | 287.547 | 325.5 | 1485.12 | 495 | 353.474 | 328.432 | 156.391 | 297.28 | 238.483 | 151.2 | 660.577 |
| 554 | 345.845 | 476.411 | 570.336 | 287.547 | 325.5 | 1485.12 | 495 | 353.474 | 328.432 | 156.391 | 297.28 | 238.483 | 151.2 | 660.577 |
| 555 | 345.844 | 476.411 | 570.336 | 287.547 | 325.5 | 1485.12 | 495 | 353.474 | 328.432 | 156.391 | 297.28 | 238.483 | 151.2 | 660.577 |
| 556 | 345.844 | 476.411 | 570.336 | 287.547 | 325.5 | 1485.12 | 495 | 353.474 | 328.432 | 156.391 | 297.28 | 238.483 | 151.2 | 660.577 |
| 557 | 345.843 | 476.411 | 570.336 | 287.547 | 325.5 | 1485.12 | 495 | 353.474 | 328.432 | 156.391 | 297.28 | 238.483 | 151.2 | 660.577 |
| 558 | 345.842 | 476.411 | 570.336 | 287.547 | 325.5 | 1485.12 | 495 | 353.474 | 328.432 | 156.391 | 297.28 | 238.483 | 151.2 | 660.577 |
| 559 | 345.841 | 476.411 | 570.336 | 287.547 | 325.5 | 1485.12 | 495 | 353.474 | 328.432 | 156.391 | 297.28 | 238.483 | 151.2 | 660.577 |
| 560 | 345.841 | 476.411 | 570.336 | 287.547 | 325.5 | 1485.12 | 495 | 353.474 | 328.432 | 156.391 | 297.28 | 238.483 | 151.2 | 660.577 |
| 561 | 345.84 | 476.411 | 570.336 | 287.547 | 325.5 | 1485.12 | 495 | 353.474 | 328.432 | 156.391 | 297.28 | 238.483 | 151.2 | 660.577 |
| 562 | 345.839 | 476.411 | 570.336 | 287.547 | 325.5 | 1485.12 | 495 | 353.474 | 328.432 | 156.391 | 297.28 | 238.483 | 151.2 | 660.577 |
| 563 | 345.839 | 476.411 | 570.336 | 287.547 | 325.5 | 1485.12 | 495 | 353.474 | 328.432 | 156.391 | 297.28 | 238.483 | 151.2 | 660.577 |
| 564 | 345.838 | 476.411 | 570.336 | 287.547 | 325.5 | 1485.12 | 495 | 353.474 | 328.432 | 156.391 | 297.28 | 238.483 | 151.2 | 660.577 |
| 565 | 345.837 | 476.411 | 570.336 | 287.547 | 325.5 | 1485.12 | 495 | 353.474 | 328.432 | 156.391 | 297.28 | 238.483 | 151.2 | 660.577 |
| 566 | 345.836 | 476.411 | 570.336 | 287.547 | 325.5 | 1485.12 | 495 | 353.474 | 328.432 | 156.391 | 297.28 | 238.483 | 151.2 | 660.577 |
| 567 | 345.836 | 476.411 | 570.336 | 287.547 | 325.5 | 1485.12 | 495 | 353.474 | 328.432 | 156.391 | 297.28 | 238.483 | 151.2 | 660.577 |
| 568 | 345.835 | 476.411 | 570.336 | 287.547 | 325.5 | 1485.12 | 495 | 353.474 | 328.432 | 156.391 | 297.28 | 238.483 | 151.2 | 660.577 |
| 569 | 345.834 | 476.411 | 570.336 | 287.547 | 325.5 | 1485.12 | 495 | 353.474 | 328.432 | 156.391 | 297.28 | 238.483 | 151.2 | 660.577 |
| 570 | 345.834 | 476.411 | 570.336 | 287.547 | 325.5 | 1485.12 | 495 | 353.474 | 328.432 | 156.391 | 297.28 | 238.483 | 151.2 | 660.577 |
| 571 | 345.833 | 476.411 | 570.336 | 287.547 | 325.5 | 1485.12 | 495 | 353.474 | 328.432 | 156.391 | 297.28 | 238.483 | 151.2 | 660.577 |
| 572 | 345.832 | 476.411 | 570.336 | 287.547 | 325.5 | 1485.12 | 495 | 353.474 | 328.432 | 156.391 | 297.28 | 238.483 | 151.2 | 660.577 |
| 573 | 345.832 | 476.411 | 570.336 | 287.547 | 325.5 | 1485.12 | 495 | 353.474 | 328.432 | 156.391 | 297.28 | 238.483 | 151.2 | 660.577 |
| 574 | 345.831 | 476.411 | 570.336 | 287.547 | 325.5 | 1485.12 | 495 | 353.474 | 328.432 | 156.391 | 297.28 | 238.483 | 151.2 | 660.577 |
| 575 | 345.83 | 476.411 | 570.336 | 287.547 | 325.5 | 1485.12 | 495 | 353.474 | 328.432 | 156.391 | 297.28 | 238.483 | 151.2 | 660.577 |
| 576 | 345.829 | 476.411 | 570.336 | 287.547 | 325.5 | 1485.12 | 495 | 353.474 | 328.432 | 156.391 | 297.28 | 238.483 | 151.2 | 660.577 |
| 577 | 345.829 | 476.411 | 570.336 | 287.547 | 325.5 | 1485.12 | 495 | 353.474 | 328.432 | 156.391 | 297.28 | 238.483 | 151.2 | 660.577 |
| 578 | 345.828 | 476.411 | 570.336 | 287.547 | 325.5 | 1485.12 | 495 | 353.474 | 328.432 | 156.391 | 297.28 | 238.483 | 151.2 | 660.577 |
| 579 | 345.827 | 476.411 | 570.336 | 287.547 | 325.5 | 1485.12 | 495 | 353.474 | 328.432 | 156.391 | 297.28 | 238.483 | 151.2 | 660.577 |
| 580 | 345.827 | 476.411 | 570.336 | 287.547 | 325.5 | 1485.12 | 495 | 353.474 | 328.432 | 156.391 | 297.28 | 238.483 | 151.2 | 660.577 |
| 581 | 345.826 | 476.411 | 570.336 | 287.547 | 325.5 | 1485.12 | 495 | 353.474 | 328.432 | 156.391 | 297.28 | 238.483 | 151.2 | 660.577 |
| 582 | 345.825 | 476.411 | 570.336 | 287.547 | 325.5 | 1485.12 | 495 | 353.474 | 328.432 | 156.391 | 297.28 | 238.483 | 151.2 | 660.577 |
| 583 | 345.825 | 476.411 | 570.336 | 287.547 | 325.5 | 1485.12 | 495 | 353.474 | 328.432 | 156.391 | 297.28 | 238.483 | 151.2 | 660.577 |
| 584 | 345.824 | 476.411 | 570.336 | 287.547 | 325.5 | 1485.12 | 495 | 353.474 | 328.432 | 156.391 | 297.28 | 238.483 | 151.2 | 660.577 |
| 585 | 345.823 | 476.411 | 570.336 | 287.547 | 325.5 | 1485.12 | 495 | 353.474 | 328.432 | 156.391 | 297.28 | 238.483 | 151.2 | 660.577 |
| 586 | 345.823 | 476.411 | 570.336 | 287.547 | 325.5 | 1485.12 | 495 | 353.474 | 328.432 | 156.391 | 297.28 | 238.483 | 151.2 | 660.577 |
| 587 | 345.822 | 476.411 | 570.336 | 287.547 | 325.5 | 1485.12 | 495 | 353.474 | 328.432 | 156.391 | 297.28 | 238.483 | 151.2 | 660.577 |
| 588 | 345.821 | 476.411 | 570.336 | 287.547 | 325.5 | 1485.12 | 495 | 353.474 | 328.432 | 156.391 | 297.28 | 238.483 | 151.2 | 660.577 |
| 589 | 345.82 | 476.411 | 570.336 | 287.547 | 325.5 | 1485.12 | 495 | 353.474 | 328.432 | 156.391 | 297.28 | 238.483 | 151.2 | 660.577 |
| 590 | 345.82 | 476.411 | 570.336 | 287.547 | 325.5 | 1485.12 | 495 | 353.474 | 328.432 | 156.391 | 297.28 | 238.483 | 151.2 | 660.577 |
| 591 | 345.819 | 476.411 | 570.336 | 287.547 | 325.5 | 1485.12 | 495 | 353.474 | 328.432 | 156.391 | 297.28 | 238.483 | 151.2 | 660.577 |
| 592 | 345.818 | 476.411 | 570.336 | 287.547 | 325.5 | 1485.12 | 495 | 353.474 | 328.432 | 156.391 | 297.28 | 238.483 | 151.2 | 660.577 |
| 593 | 345.818 | 476.411 | 570.336 | 287.547 | 325.5 | 1485.12 | 495 | 353.474 | 328.432 | 156.391 | 297.28 | 238.483 | 151.2 | 660.577 |
| 594 | 345.817 | 476.411 | 570.336 | 287.547 | 325.5 | 1485.12 | 495 | 353.474 | 328.432 | 156.391 | 297.28 | 238.483 | 151.2 | 660.577 |
| 595 | 345.816 | 476.411 | 570.336 | 287.547 | 325.5 | 1485.12 | 495 | 353.474 | 328.432 | 156.391 | 297.28 | 238.483 | 151.2 | 660.577 |
| 596 | 345.816 | 476.411 | 570.336 | 287.547 | 325.5 | 1485.12 | 495 | 353.474 | 328.432 | 156.391 | 297.28 | 238.483 | 151.2 | 660.577 |
| 597 | 345.815 | 476.411 | 570.336 | 287.547 | 325.5 | 1485.12 | 495 | 353.474 | 328.432 | 156.391 | 297.28 | 238.483 | 151.2 | 660.577 |
| 598 | 345.814 | 476.411 | 570.336 | 287.547 | 325.5 | 1485.12 | 495 | 353.474 | 328.432 | 156.391 | 297.28 | 238.483 | 151.2 | 660.577 |
| 599 | 345.814 | 476.411 | 570.336 | 287.547 | 325.5 | 1485.12 | 495 | 353.474 | 328.432 | 156.391 | 297.28 | 238.483 | 151.2 | 660.577 |
| 600 | 345.813 | 476.411 | 570.336 | 287.547 | 325.5 | 1485.12 | 495 | 353.474 | 328.432 | 156.391 | 297.28 | 238.483 | 151.2 | 660.577 |
| 601 | 345.812 | 476.411 | 570.336 | 287.547 | 325.5 | 1485.12 | 495 | 353.474 | 328.432 | 156.391 | 297.28 | 238.483 | 151.2 | 660.577 |
| 602 | 345.812 | 476.411 | 570.336 | 287.547 | 325.5 | 1485.12 | 495 | 353.474 | 328.432 | 156.391 | 297.28 | 238.483 | 151.2 | 660.577 |
| 603 | 345.811 | 476.411 | 570.336 | 287.547 | 325.5 | 1485.12 | 495 | 353.474 | 328.432 | 156.391 | 297.28 | 238.483 | 151.2 | 660.577 |
| 604 | 345.81 | 476.411 | 570.336 | 287.547 | 325.5 | 1485.12 | 495 | 353.474 | 328.432 | 156.391 | 297.28 | 238.483 | 151.2 | 660.577 |
| 605 | 345.81 | 476.411 | 570.336 | 287.547 | 325.5 | 1485.12 | 495 | 353.474 | 328.432 | 156.391 | 297.28 | 238.483 | 151.2 | 660.577 |
| 606 | 345.809 | 476.411 | 570.336 | 287.547 | 325.5 | 1485.12 | 495 | 353.474 | 328.432 | 156.391 | 297.28 | 238.483 | 151.2 | 660.577 |
| 607 | 345.808 | 476.411 | 570.336 | 287.547 | 325.5 | 1485.12 | 495 | 353.474 | 328.432 | 156.391 | 297.28 | 238.483 | 151.2 | 660.577 |
| 608 | 345.808 | 476.411 | 570.336 | 287.547 | 325.5 | 1485.12 | 495 | 353.474 | 328.432 | 156.391 | 297.28 | 238.483 | 151.2 | 660.577 |
| 609 | 345.807 | 476.411 | 570.336 | 287.547 | 325.5 | 1485.12 | 495 | 353.474 | 328.432 | 156.391 | 297.28 | 238.483 | 151.2 | 660.577 |
| 610 | 345.806 | 476.411 | 570.336 | 287.547 | 325.5 | 1485.12 | 495 | 353.474 | 328.432 | 156.391 | 297.28 | 238.483 | 151.2 | 660.577 |
| 611 | 345.806 | 476.411 | 570.336 | 287.547 | 325.5 | 1485.12 | 495 | 353.474 | 328.432 | 156.391 | 297.28 | 238.483 | 151.2 | 660.577 |
| 612 | 345.805 | 476.411 | 570.336 | 287.547 | 325.5 | 1485.12 | 495 | 353.474 | 328.432 | 156.391 | 297.28 | 238.483 | 151.2 | 660.577 |
| 613 | 345.804 | 476.411 | 570.336 | 287.547 | 325.5 | 1485.12 | 495 | 353.474 | 328.432 | 156.391 | 297.28 | 238.483 | 151.2 | 660.577 |
| 614 | 345.804 | 476.411 | 570.336 | 287.547 | 325.5 | 1485.12 | 495 | 353.474 | 328.432 | 156.391 | 297.28 | 238.483 | 151.2 | 660.577 |
| 615 | 345.803 | 476.411 | 570.336 | 287.547 | 325.5 | 1485.12 | 495 | 353.474 | 328.432 | 156.391 | 297.28 | 238.483 | 151.2 | 660.577 |
| 616 | 345.802 | 476.411 | 570.336 | 287.547 | 325.5 | 1485.12 | 495 | 353.474 | 328.432 | 156.391 | 297.28 | 238.483 | 151.2 | 660.577 |
| 617 | 345.802 | 476.411 | 570.336 | 287.547 | 325.5 | 1485.12 | 495 | 353.474 | 328.432 | 156.391 | 297.28 | 238.483 | 151.2 | 660.577 |
| 618 | 345.801 | 476.411 | 570.336 | 287.547 | 325.5 | 1485.12 | 495 | 353.474 | 328.432 | 156.391 | 297.28 | 238.483 | 151.2 | 660.577 |
| 619 | 345.801 | 476.411 | 570.336 | 287.547 | 325.5 | 1485.12 | 495 | 353.474 | 328.432 | 156.391 | 297.28 | 238.483 | 151.2 | 660.577 |
| 620 | 345.8 | 476.411 | 570.336 | 287.547 | 325.5 | 1485.12 | 495 | 353.474 | 328.432 | 156.391 | 297.28 | 238.483 | 151.2 | 660.577 |
| 621 | 345.799 | 476.411 | 570.336 | 287.547 | 325.5 | 1485.12 | 495 | 353.474 | 328.432 | 156.391 | 297.28 | 238.483 | 151.2 | 660.577 |
| 622 | 345.799 | 476.411 | 570.336 | 287.547 | 325.5 | 1485.12 | 495 | 353.474 | 328.432 | 156.391 | 297.28 | 238.483 | 151.2 | 660.577 |
| 623 | 345.798 | 476.411 | 570.336 | 287.547 | 325.5 | 1485.12 | 495 | 353.474 | 328.432 | 156.391 | 297.28 | 238.483 | 151.2 | 660.577 |
| 624 | 345.797 | 476.411 | 570.336 | 287.547 | 325.5 | 1485.12 | 495 | 353.474 | 328.432 | 156.391 | 297.28 | 238.483 | 151.2 | 660.577 |
| 625 | 345.797 | 476.411 | 570.336 | 287.547 | 325.5 | 1485.12 | 495 | 353.474 | 328.432 | 156.391 | 297.28 | 238.483 | 151.2 | 660.577 |
| 626 | 345.796 | 476.411 | 570.336 | 287.547 | 325.5 | 1485.12 | 495 | 353.474 | 328.432 | 156.391 | 297.28 | 238.483 | 151.2 | 660.577 |
| 627 | 345.795 | 476.411 | 570.336 | 287.547 | 325.5 | 1485.12 | 495 | 353.474 | 328.432 | 156.391 | 297.28 | 238.483 | 151.2 | 660.577 |
| 628 | 345.795 | 476.411 | 570.336 | 287.547 | 325.5 | 1485.12 | 495 | 353.474 | 328.432 | 156.391 | 297.28 | 238.483 | 151.2 | 660.577 |
| 629 | 345.794 | 476.411 | 570.336 | 287.547 | 325.5 | 1485.12 | 495 | 353.474 | 328.432 | 156.391 | 297.28 | 238.483 | 151.2 | 660.577 |
| 630 | 345.793 | 476.411 | 570.336 | 287.547 | 325.5 | 1485.12 | 495 | 353.474 | 328.432 | 156.391 | 297.28 | 238.483 | 151.2 | 660.577 |
| 631 | 345.793 | 476.411 | 570.336 | 287.547 | 325.5 | 1485.12 | 495 | 353.474 | 328.432 | 156.391 | 297.28 | 238.483 | 151.2 | 660.577 |
| 632 | 345.792 | 476.411 | 570.336 | 287.547 | 325.5 | 1485.12 | 495 | 353.474 | 328.432 | 156.391 | 297.28 | 238.483 | 151.2 | 660.577 |
| 633 | 345.792 | 476.411 | 570.336 | 287.547 | 325.5 | 1485.12 | 495 | 353.474 | 328.432 | 156.391 | 297.28 | 238.483 | 151.2 | 660.577 |
| 634 | 345.791 | 476.411 | 570.336 | 287.547 | 325.5 | 1485.12 | 495 | 353.474 | 328.432 | 156.391 | 297.28 | 238.483 | 151.2 | 660.577 |
| 635 | 345.79 | 476.411 | 570.336 | 287.547 | 325.5 | 1485.12 | 495 | 353.474 | 328.432 | 156.391 | 297.28 | 238.483 | 151.2 | 660.577 |
| 636 | 345.79 | 476.411 | 570.336 | 287.547 | 325.5 | 1485.12 | 495 | 353.474 | 328.432 | 156.391 | 297.28 | 238.483 | 151.2 | 660.577 |
| 637 | 345.789 | 476.411 | 570.336 | 287.547 | 325.5 | 1485.12 | 495 | 353.474 | 328.432 | 156.391 | 297.28 | 238.483 | 151.2 | 660.577 |
| 638 | 345.788 | 476.411 | 570.336 | 287.547 | 325.5 | 1485.12 | 495 | 353.474 | 328.432 | 156.391 | 297.28 | 238.483 | 151.2 | 660.577 |
| 639 | 345.788 | 476.411 | 570.336 | 287.547 | 325.5 | 1485.12 | 495 | 353.474 | 328.432 | 156.391 | 297.28 | 238.483 | 151.2 | 660.577 |
| 640 | 345.787 | 476.411 | 570.336 | 287.547 | 325.5 | 1485.12 | 495 | 353.474 | 328.432 | 156.391 | 297.28 | 238.483 | 151.2 | 660.577 |
| 641 | 345.787 | 476.411 | 570.336 | 287.547 | 325.5 | 1485.12 | 495 | 353.474 | 328.432 | 156.391 | 297.28 | 238.483 | 151.2 | 660.577 |
| 642 | 345.786 | 476.411 | 570.336 | 287.547 | 325.5 | 1485.12 | 495 | 353.474 | 328.432 | 156.391 | 297.28 | 238.483 | 151.2 | 660.577 |
| 643 | 345.785 | 476.411 | 570.336 | 287.547 | 325.5 | 1485.12 | 495 | 353.474 | 328.432 | 156.391 | 297.28 | 238.483 | 151.2 | 660.577 |
| 644 | 345.785 | 476.411 | 570.336 | 287.547 | 325.5 | 1485.12 | 495 | 353.474 | 328.432 | 156.391 | 297.28 | 238.483 | 151.2 | 660.577 |
| 645 | 345.784 | 476.411 | 570.336 | 287.547 | 325.5 | 1485.12 | 495 | 353.474 | 328.432 | 156.391 | 297.28 | 238.483 | 151.2 | 660.577 |
| 646 | 345.783 | 476.411 | 570.336 | 287.547 | 325.5 | 1485.12 | 495 | 353.474 | 328.432 | 156.391 | 297.28 | 238.483 | 151.2 | 660.577 |
| 647 | 345.783 | 476.411 | 570.336 | 287.547 | 325.5 | 1485.12 | 495 | 353.474 | 328.432 | 156.391 | 297.28 | 238.483 | 151.2 | 660.577 |
| 648 | 345.782 | 476.411 | 570.336 | 287.547 | 325.5 | 1485.12 | 495 | 353.474 | 328.432 | 156.391 | 297.28 | 238.483 | 151.2 | 660.577 |
| 649 | 345.782 | 476.411 | 570.336 | 287.547 | 325.5 | 1485.12 | 495 | 353.474 | 328.432 | 156.391 | 297.28 | 238.483 | 151.2 | 660.577 |
| 650 | 345.781 | 476.411 | 570.336 | 287.547 | 325.5 | 1485.12 | 495 | 353.474 | 328.432 | 156.391 | 297.28 | 238.483 | 151.2 | 660.577 |
| 651 | 345.78 | 476.411 | 570.336 | 287.547 | 325.5 | 1485.12 | 495 | 353.474 | 328.432 | 156.391 | 297.28 | 238.483 | 151.2 | 660.577 |
| 652 | 345.78 | 476.411 | 570.336 | 287.547 | 325.5 | 1485.12 | 495 | 353.474 | 328.432 | 156.391 | 297.28 | 238.483 | 151.2 | 660.577 |
| 653 | 345.779 | 476.411 | 570.336 | 287.547 | 325.5 | 1485.12 | 495 | 353.474 | 328.432 | 156.391 | 297.28 | 238.483 | 151.2 | 660.577 |
| 654 | 345.779 | 476.411 | 570.336 | 287.547 | 325.5 | 1485.12 | 495 | 353.474 | 328.432 | 156.391 | 297.28 | 238.483 | 151.2 | 660.577 |
| 655 | 345.778 | 476.411 | 570.336 | 287.547 | 325.5 | 1485.12 | 495 | 353.474 | 328.432 | 156.391 | 297.28 | 238.483 | 151.2 | 660.577 |
| 656 | 345.777 | 476.411 | 570.336 | 287.547 | 325.5 | 1485.12 | 495 | 353.474 | 328.432 | 156.391 | 297.28 | 238.483 | 151.2 | 660.577 |
| 657 | 345.777 | 476.411 | 570.336 | 287.547 | 325.5 | 1485.12 | 495 | 353.474 | 328.432 | 156.391 | 297.28 | 238.483 | 151.2 | 660.577 |
| 658 | 345.776 | 476.411 | 570.336 | 287.547 | 325.5 | 1485.12 | 495 | 353.474 | 328.432 | 156.391 | 297.28 | 238.483 | 151.2 | 660.577 |
| 659 | 345.775 | 476.411 | 570.336 | 287.547 | 325.5 | 1485.12 | 495 | 353.474 | 328.432 | 156.391 | 297.28 | 238.483 | 151.2 | 660.577 |
| 660 | 345.775 | 476.411 | 570.336 | 287.547 | 325.5 | 1485.12 | 495 | 353.474 | 328.432 | 156.391 | 297.28 | 238.483 | 151.2 | 660.577 |
| 661 | 345.774 | 476.411 | 570.336 | 287.547 | 325.5 | 1485.12 | 495 | 353.474 | 328.432 | 156.391 | 297.28 | 238.483 | 151.2 | 660.577 |
| 662 | 345.774 | 476.411 | 570.336 | 287.547 | 325.5 | 1485.12 | 495 | 353.474 | 328.432 | 156.391 | 297.28 | 238.483 | 151.2 | 660.577 |
| 663 | 345.773 | 476.411 | 570.336 | 287.547 | 325.5 | 1485.12 | 495 | 353.474 | 328.432 | 156.391 | 297.28 | 238.483 | 151.2 | 660.577 |
| 664 | 345.772 | 476.411 | 570.336 | 287.547 | 325.5 | 1485.12 | 495 | 353.474 | 328.432 | 156.391 | 297.28 | 238.483 | 151.2 | 660.577 |
| 665 | 345.772 | 476.411 | 570.336 | 287.547 | 325.5 | 1485.12 | 495 | 353.474 | 328.432 | 156.391 | 297.28 | 238.483 | 151.2 | 660.577 |
| 666 | 345.771 | 476.411 | 570.336 | 287.547 | 325.5 | 1485.12 | 495 | 353.474 | 328.432 | 156.391 | 297.28 | 238.483 | 151.2 | 660.577 |
| 667 | 345.771 | 476.411 | 570.336 | 287.547 | 325.5 | 1485.12 | 495 | 353.474 | 328.432 | 156.391 | 297.28 | 238.483 | 151.2 | 660.577 |
| 668 | 345.77 | 476.411 | 570.336 | 287.547 | 325.5 | 1485.12 | 495 | 353.474 | 328.432 | 156.391 | 297.28 | 238.483 | 151.2 | 660.577 |
| 669 | 345.769 | 476.411 | 570.336 | 287.547 | 325.5 | 1485.12 | 495 | 353.474 | 328.432 | 156.391 | 297.28 | 238.483 | 151.2 | 660.577 |
| 670 | 345.769 | 476.411 | 570.336 | 287.547 | 325.5 | 1485.12 | 495 | 353.474 | 328.432 | 156.391 | 297.28 | 238.483 | 151.2 | 660.577 |
| 671 | 345.768 | 476.411 | 570.336 | 287.547 | 325.5 | 1485.12 | 495 | 353.474 | 328.432 | 156.391 | 297.28 | 238.483 | 151.2 | 660.577 |
| 672 | 345.768 | 476.411 | 570.336 | 287.547 | 325.5 | 1485.12 | 495 | 353.474 | 328.432 | 156.391 | 297.28 | 238.483 | 151.2 | 660.577 |
| 673 | 345.767 | 476.411 | 570.336 | 287.547 | 325.5 | 1485.12 | 495 | 353.474 | 328.432 | 156.391 | 297.28 | 238.483 | 151.2 | 660.577 |
| 674 | 345.766 | 476.411 | 570.336 | 287.547 | 325.5 | 1485.12 | 495 | 353.474 | 328.432 | 156.391 | 297.28 | 238.483 | 151.2 | 660.577 |
| 675 | 345.766 | 476.411 | 570.336 | 287.547 | 325.5 | 1485.12 | 495 | 353.474 | 328.432 | 156.391 | 297.28 | 238.483 | 151.2 | 660.577 |
| 676 | 345.765 | 476.411 | 570.336 | 287.547 | 325.5 | 1485.12 | 495 | 353.474 | 328.432 | 156.391 | 297.28 | 238.483 | 151.2 | 660.577 |
| 677 | 345.765 | 476.411 | 570.336 | 287.547 | 325.5 | 1485.12 | 495 | 353.474 | 328.432 | 156.391 | 297.28 | 238.483 | 151.2 | 660.577 |
| 678 | 345.764 | 476.411 | 570.336 | 287.547 | 325.5 | 1485.12 | 495 | 353.474 | 328.432 | 156.391 | 297.28 | 238.483 | 151.2 | 660.577 |
| 679 | 345.763 | 476.411 | 570.336 | 287.547 | 325.5 | 1485.12 | 495 | 353.474 | 328.432 | 156.391 | 297.28 | 238.483 | 151.2 | 660.577 |
| 680 | 345.763 | 476.411 | 570.336 | 287.547 | 325.5 | 1485.12 | 495 | 353.474 | 328.432 | 156.391 | 297.28 | 238.483 | 151.2 | 660.577 |
| 681 | 345.762 | 476.411 | 570.336 | 287.547 | 325.5 | 1485.12 | 495 | 353.474 | 328.432 | 156.391 | 297.28 | 238.483 | 151.2 | 660.577 |
| 682 | 345.762 | 476.411 | 570.336 | 287.547 | 325.5 | 1485.12 | 495 | 353.474 | 328.432 | 156.391 | 297.28 | 238.483 | 151.2 | 660.577 |
| 683 | 345.761 | 476.411 | 570.336 | 287.547 | 325.5 | 1485.12 | 495 | 353.474 | 328.432 | 156.391 | 297.28 | 238.483 | 151.2 | 660.577 |
| 684 | 345.761 | 476.411 | 570.336 | 287.547 | 325.5 | 1485.12 | 495 | 353.474 | 328.432 | 156.391 | 297.28 | 238.483 | 151.2 | 660.577 |
| 685 | 345.76 | 476.411 | 570.336 | 287.547 | 325.5 | 1485.12 | 495 | 353.474 | 328.432 | 156.391 | 297.28 | 238.483 | 151.2 | 660.577 |
| 686 | 345.759 | 476.411 | 570.336 | 287.547 | 325.5 | 1485.12 | 495 | 353.474 | 328.432 | 156.391 | 297.28 | 238.483 | 151.2 | 660.577 |
| 687 | 345.759 | 476.411 | 570.336 | 287.547 | 325.5 | 1485.12 | 495 | 353.474 | 328.432 | 156.391 | 297.28 | 238.483 | 151.2 | 660.577 |
| 688 | 345.758 | 476.411 | 570.336 | 287.547 | 325.5 | 1485.12 | 495 | 353.474 | 328.432 | 156.391 | 297.28 | 238.483 | 151.2 | 660.577 |
| 689 | 345.758 | 476.411 | 570.336 | 287.547 | 325.5 | 1485.12 | 495 | 353.474 | 328.432 | 156.391 | 297.28 | 238.483 | 151.2 | 660.577 |
| 690 | 345.757 | 476.411 | 570.336 | 287.547 | 325.5 | 1485.12 | 495 | 353.474 | 328.432 | 156.391 | 297.28 | 238.483 | 151.2 | 660.577 |
| 691 | 345.756 | 476.411 | 570.336 | 287.547 | 325.5 | 1485.12 | 495 | 353.474 | 328.432 | 156.391 | 297.28 | 238.483 | 151.2 | 660.577 |
| 692 | 345.756 | 476.411 | 570.336 | 287.547 | 325.5 | 1485.12 | 495 | 353.474 | 328.432 | 156.391 | 297.28 | 238.483 | 151.2 | 660.577 |
| 693 | 345.755 | 476.411 | 570.336 | 287.547 | 325.5 | 1485.12 | 495 | 353.474 | 328.432 | 156.391 | 297.28 | 238.483 | 151.2 | 660.577 |
| 694 | 345.755 | 476.411 | 570.336 | 287.547 | 325.5 | 1485.12 | 495 | 353.474 | 328.432 | 156.391 | 297.28 | 238.483 | 151.2 | 660.577 |
| 695 | 345.754 | 476.411 | 570.336 | 287.547 | 325.5 | 1485.12 | 495 | 353.474 | 328.432 | 156.391 | 297.28 | 238.483 | 151.2 | 660.577 |
| 696 | 345.754 | 476.411 | 570.336 | 287.547 | 325.5 | 1485.12 | 495 | 353.474 | 328.432 | 156.391 | 297.28 | 238.483 | 151.2 | 660.577 |
| 697 | 345.753 | 476.411 | 570.336 | 287.547 | 325.5 | 1485.12 | 495 | 353.474 | 328.432 | 156.391 | 297.28 | 238.483 | 151.2 | 660.577 |
| 698 | 345.752 | 476.411 | 570.336 | 287.547 | 325.5 | 1485.12 | 495 | 353.474 | 328.432 | 156.391 | 297.28 | 238.483 | 151.2 | 660.577 |
| 699 | 345.752 | 476.411 | 570.336 | 287.547 | 325.5 | 1485.12 | 495 | 353.474 | 328.432 | 156.391 | 297.28 | 238.483 | 151.2 | 660.577 |
| 700 | 345.751 | 476.411 | 570.336 | 287.547 | 325.5 | 1485.12 | 495 | 353.474 | 328.432 | 156.391 | 297.28 | 238.483 | 151.2 | 660.577 |
| 701 | 345.751 | 476.411 | 570.336 | 287.547 | 325.5 | 1485.12 | 495 | 353.474 | 328.432 | 156.391 | 297.28 | 238.483 | 151.2 | 660.577 |
| 702 | 345.75 | 476.411 | 570.336 | 287.547 | 325.5 | 1485.12 | 495 | 353.474 | 328.432 | 156.391 | 297.28 | 238.483 | 151.2 | 660.577 |
| 703 | 345.75 | 476.411 | 570.336 | 287.547 | 325.5 | 1485.12 | 495 | 353.474 | 328.432 | 156.391 | 297.28 | 238.483 | 151.2 | 660.577 |
| 704 | 345.749 | 476.411 | 570.336 | 287.547 | 325.5 | 1485.12 | 495 | 353.474 | 328.432 | 156.391 | 297.28 | 238.483 | 151.2 | 660.577 |
| 705 | 345.748 | 476.411 | 570.336 | 287.547 | 325.5 | 1485.12 | 495 | 353.474 | 328.432 | 156.391 | 297.28 | 238.483 | 151.2 | 660.577 |
| 706 | 345.748 | 476.411 | 570.336 | 287.547 | 325.5 | 1485.12 | 495 | 353.474 | 328.432 | 156.391 | 297.28 | 238.483 | 151.2 | 660.577 |
| 707 | 345.747 | 476.411 | 570.336 | 287.547 | 325.5 | 1485.12 | 495 | 353.474 | 328.432 | 156.391 | 297.28 | 238.483 | 151.2 | 660.577 |
| 708 | 345.747 | 476.411 | 570.336 | 287.547 | 325.5 | 1485.12 | 495 | 353.474 | 328.432 | 156.391 | 297.28 | 238.483 | 151.2 | 660.577 |
| 709 | 345.746 | 476.411 | 570.336 | 287.547 | 325.5 | 1485.12 | 495 | 353.474 | 328.432 | 156.391 | 297.28 | 238.483 | 151.2 | 660.577 |
| 710 | 345.746 | 476.411 | 570.336 | 287.547 | 325.5 | 1485.12 | 495 | 353.474 | 328.432 | 156.391 | 297.28 | 238.483 | 151.2 | 660.577 |
| 711 | 345.745 | 476.411 | 570.336 | 287.547 | 325.5 | 1485.12 | 495 | 353.474 | 328.432 | 156.391 | 297.28 | 238.483 | 151.2 | 660.577 |
| 712 | 345.744 | 476.411 | 570.336 | 287.547 | 325.5 | 1485.12 | 495 | 353.474 | 328.432 | 156.391 | 297.28 | 238.483 | 151.2 | 660.577 |
| 713 | 345.744 | 476.411 | 570.336 | 287.547 | 325.5 | 1485.12 | 495 | 353.474 | 328.432 | 156.391 | 297.28 | 238.483 | 151.2 | 660.577 |
| 714 | 345.743 | 476.411 | 570.336 | 287.547 | 325.5 | 1485.12 | 495 | 353.474 | 328.432 | 156.391 | 297.28 | 238.483 | 151.2 | 660.577 |
| 715 | 345.743 | 476.411 | 570.336 | 287.547 | 325.5 | 1485.12 | 495 | 353.474 | 328.432 | 156.391 | 297.28 | 238.483 | 151.2 | 660.577 |
| 716 | 345.742 | 476.411 | 570.336 | 287.547 | 325.5 | 1485.12 | 495 | 353.474 | 328.432 | 156.391 | 297.28 | 238.483 | 151.2 | 660.577 |
| 717 | 345.742 | 476.411 | 570.336 | 287.547 | 325.5 | 1485.12 | 495 | 353.474 | 328.432 | 156.391 | 297.28 | 238.483 | 151.2 | 660.577 |
| 718 | 345.741 | 476.411 | 570.336 | 287.547 | 325.5 | 1485.12 | 495 | 353.474 | 328.432 | 156.391 | 297.28 | 238.483 | 151.2 | 660.577 |
| 719 | 345.741 | 476.411 | 570.336 | 287.547 | 325.5 | 1485.12 | 495 | 353.474 | 328.432 | 156.391 | 297.28 | 238.483 | 151.2 | 660.577 |
| 720 | 345.74 | 476.411 | 570.336 | 287.547 | 325.5 | 1485.12 | 495 | 353.474 | 328.432 | 156.391 | 297.28 | 238.483 | 151.2 | 660.577 |
| 721 | 345.739 | 476.411 | 570.336 | 287.547 | 325.5 | 1485.12 | 495 | 353.474 | 328.432 | 156.391 | 297.28 | 238.483 | 151.2 | 660.577 |
| 722 | 345.739 | 476.411 | 570.336 | 287.547 | 325.5 | 1485.12 | 495 | 353.474 | 328.432 | 156.391 | 297.28 | 238.483 | 151.2 | 660.577 |
| 723 | 345.738 | 476.411 | 570.336 | 287.547 | 325.5 | 1485.12 | 495 | 353.474 | 328.432 | 156.391 | 297.28 | 238.483 | 151.2 | 660.577 |
| 724 | 345.738 | 476.411 | 570.336 | 287.547 | 325.5 | 1485.12 | 495 | 353.474 | 328.432 | 156.391 | 297.28 | 238.483 | 151.2 | 660.577 |
| 725 | 345.737 | 476.411 | 570.336 | 287.547 | 325.5 | 1485.12 | 495 | 353.474 | 328.432 | 156.391 | 297.28 | 238.483 | 151.2 | 660.577 |
| 726 | 345.737 | 476.411 | 570.336 | 287.547 | 325.5 | 1485.12 | 495 | 353.474 | 328.432 | 156.391 | 297.28 | 238.483 | 151.2 | 660.577 |
| 727 | 345.736 | 476.411 | 570.336 | 287.547 | 325.5 | 1485.12 | 495 | 353.474 | 328.432 | 156.391 | 297.28 | 238.483 | 151.2 | 660.577 |
| 728 | 345.736 | 476.411 | 570.336 | 287.547 | 325.5 | 1485.12 | 495 | 353.474 | 328.432 | 156.391 | 297.28 | 238.483 | 151.2 | 660.577 |
| 729 | 345.735 | 476.411 | 570.336 | 287.547 | 325.5 | 1485.12 | 495 | 353.474 | 328.432 | 156.391 | 297.28 | 238.483 | 151.2 | 660.577 |
| 730 | 345.734 | 476.411 | 570.336 | 287.547 | 325.5 | 1485.12 | 495 | 353.474 | 328.432 | 156.391 | 297.28 | 238.483 | 151.2 | 660.577 |
| 731 | 345.734 | 476.411 | 570.336 | 287.547 | 325.5 | 1485.12 | 495 | 353.474 | 328.432 | 156.391 | 297.28 | 238.483 | 151.2 | 660.577 |
| 732 | 345.733 | 476.411 | 570.336 | 287.547 | 325.5 | 1485.12 | 495 | 353.474 | 328.432 | 156.391 | 297.28 | 238.483 | 151.2 | 660.577 |
| 733 | 345.733 | 476.411 | 570.336 | 287.547 | 325.5 | 1485.12 | 495 | 353.474 | 328.432 | 156.391 | 297.28 | 238.483 | 151.2 | 660.577 |
| 734 | 345.732 | 476.411 | 570.336 | 287.547 | 325.5 | 1485.12 | 495 | 353.474 | 328.432 | 156.391 | 297.28 | 238.483 | 151.2 | 660.577 |
| 735 | 345.732 | 476.411 | 570.336 | 287.547 | 325.5 | 1485.12 | 495 | 353.474 | 328.432 | 156.391 | 297.28 | 238.483 | 151.2 | 660.577 |
| 736 | 345.731 | 476.411 | 570.336 | 287.547 | 325.5 | 1485.12 | 495 | 353.474 | 328.432 | 156.391 | 297.28 | 238.483 | 151.2 | 660.577 |
| 737 | 345.731 | 476.411 | 570.336 | 287.547 | 325.5 | 1485.12 | 495 | 353.474 | 328.432 | 156.391 | 297.28 | 238.483 | 151.2 | 660.577 |
| 738 | 345.73 | 476.411 | 570.336 | 287.547 | 325.5 | 1485.12 | 495 | 353.474 | 328.432 | 156.391 | 297.28 | 238.483 | 151.2 | 660.577 |
| 739 | 345.73 | 476.411 | 570.336 | 287.547 | 325.5 | 1485.12 | 495 | 353.474 | 328.432 | 156.391 | 297.28 | 238.483 | 151.2 | 660.577 |
| 740 | 345.729 | 476.411 | 570.336 | 287.547 | 325.5 | 1485.12 | 495 | 353.474 | 328.432 | 156.391 | 297.28 | 238.483 | 151.2 | 660.577 |
| 741 | 345.728 | 476.411 | 570.336 | 287.547 | 325.5 | 1485.12 | 495 | 353.474 | 328.432 | 156.391 | 297.28 | 238.483 | 151.2 | 660.577 |
| 742 | 345.728 | 476.411 | 570.336 | 287.547 | 325.5 | 1485.12 | 495 | 353.474 | 328.432 | 156.391 | 297.28 | 238.483 | 151.2 | 660.577 |
| 743 | 345.727 | 476.411 | 570.336 | 287.547 | 325.5 | 1485.12 | 495 | 353.474 | 328.432 | 156.391 | 297.28 | 238.483 | 151.2 | 660.577 |
| 744 | 345.727 | 476.411 | 570.336 | 287.547 | 325.5 | 1485.12 | 495 | 353.474 | 328.432 | 156.391 | 297.28 | 238.483 | 151.2 | 660.577 |
| 745 | 345.726 | 476.411 | 570.336 | 287.547 | 325.5 | 1485.12 | 495 | 353.474 | 328.432 | 156.391 | 297.28 | 238.483 | 151.2 | 660.577 |
| 746 | 345.726 | 476.411 | 570.336 | 287.547 | 325.5 | 1485.12 | 495 | 353.474 | 328.432 | 156.391 | 297.28 | 238.483 | 151.2 | 660.577 |
| 747 | 345.725 | 476.411 | 570.336 | 287.547 | 325.5 | 1485.12 | 495 | 353.474 | 328.432 | 156.391 | 297.28 | 238.483 | 151.2 | 660.577 |
| 748 | 345.725 | 476.411 | 570.336 | 287.547 | 325.5 | 1485.12 | 495 | 353.474 | 328.432 | 156.391 | 297.28 | 238.483 | 151.2 | 660.577 |
| 749 | 345.724 | 476.411 | 570.336 | 287.547 | 325.5 | 1485.12 | 495 | 353.474 | 328.432 | 156.391 | 297.28 | 238.483 | 151.2 | 660.577 |
| 750 | 345.724 | 476.411 | 570.336 | 287.547 | 325.5 | 1485.12 | 495 | 353.474 | 328.432 | 156.391 | 297.28 | 238.483 | 151.2 | 660.577 |
| 751 | 345.723 | 476.411 | 570.336 | 287.547 | 325.5 | 1485.12 | 495 | 353.474 | 328.432 | 156.391 | 297.28 | 238.483 | 151.2 | 660.577 |
| 752 | 345.723 | 476.411 | 570.336 | 287.547 | 325.5 | 1485.12 | 495 | 353.474 | 328.432 | 156.391 | 297.28 | 238.483 | 151.2 | 660.577 |
| 753 | 345.722 | 476.411 | 570.336 | 287.547 | 325.5 | 1485.12 | 495 | 353.474 | 328.432 | 156.391 | 297.28 | 238.483 | 151.2 | 660.577 |
| 754 | 345.721 | 476.411 | 570.336 | 287.547 | 325.5 | 1485.12 | 495 | 353.474 | 328.432 | 156.391 | 297.28 | 238.483 | 151.2 | 660.577 |
| 755 | 345.721 | 476.411 | 570.336 | 287.547 | 325.5 | 1485.12 | 495 | 353.474 | 328.432 | 156.391 | 297.28 | 238.483 | 151.2 | 660.577 |
| 756 | 345.72 | 476.411 | 570.336 | 287.547 | 325.5 | 1485.12 | 495 | 353.474 | 328.432 | 156.391 | 297.28 | 238.483 | 151.2 | 660.577 |
| 757 | 345.72 | 476.411 | 570.336 | 287.547 | 325.5 | 1485.12 | 495 | 353.474 | 328.432 | 156.391 | 297.28 | 238.483 | 151.2 | 660.577 |
| 758 | 345.719 | 476.411 | 570.336 | 287.547 | 325.5 | 1485.12 | 495 | 353.474 | 328.432 | 156.391 | 297.28 | 238.483 | 151.2 | 660.577 |
| 759 | 345.719 | 476.411 | 570.336 | 287.547 | 325.5 | 1485.12 | 495 | 353.474 | 328.432 | 156.391 | 297.28 | 238.483 | 151.2 | 660.577 |
| 760 | 345.718 | 476.411 | 570.336 | 287.547 | 325.5 | 1485.12 | 495 | 353.474 | 328.432 | 156.391 | 297.28 | 238.483 | 151.2 | 660.577 |
| 761 | 345.718 | 476.411 | 570.336 | 287.547 | 325.5 | 1485.12 | 495 | 353.474 | 328.432 | 156.391 | 297.28 | 238.483 | 151.2 | 660.577 |
| 762 | 345.717 | 476.411 | 570.336 | 287.547 | 325.5 | 1485.12 | 495 | 353.474 | 328.432 | 156.391 | 297.28 | 238.483 | 151.2 | 660.577 |
| 763 | 345.717 | 476.411 | 570.336 | 287.547 | 325.5 | 1485.12 | 495 | 353.474 | 328.432 | 156.391 | 297.28 | 238.483 | 151.2 | 660.577 |
| 764 | 345.716 | 476.411 | 570.336 | 287.547 | 325.5 | 1485.12 | 495 | 353.474 | 328.432 | 156.391 | 297.28 | 238.483 | 151.2 | 660.577 |
| 765 | 345.716 | 476.411 | 570.336 | 287.547 | 325.5 | 1485.12 | 495 | 353.474 | 328.432 | 156.391 | 297.28 | 238.483 | 151.2 | 660.577 |
| 766 | 345.715 | 476.411 | 570.336 | 287.547 | 325.5 | 1485.12 | 495 | 353.474 | 328.432 | 156.391 | 297.28 | 238.483 | 151.2 | 660.577 |
| 767 | 345.715 | 476.411 | 570.336 | 287.547 | 325.5 | 1485.12 | 495 | 353.474 | 328.432 | 156.391 | 297.28 | 238.483 | 151.2 | 660.577 |
| 768 | 345.714 | 476.411 | 570.336 | 287.547 | 325.5 | 1485.12 | 495 | 353.474 | 328.432 | 156.391 | 297.28 | 238.483 | 151.2 | 660.577 |
| 769 | 345.714 | 476.411 | 570.336 | 287.547 | 325.5 | 1485.12 | 495 | 353.474 | 328.432 | 156.391 | 297.28 | 238.483 | 151.2 | 660.577 |
| 770 | 345.713 | 476.411 | 570.336 | 287.547 | 325.5 | 1485.12 | 495 | 353.474 | 328.432 | 156.391 | 297.28 | 238.483 | 151.2 | 660.577 |
| 771 | 345.713 | 476.411 | 570.336 | 287.547 | 325.5 | 1485.12 | 495 | 353.474 | 328.432 | 156.391 | 297.28 | 238.483 | 151.2 | 660.577 |
| 772 | 345.712 | 476.411 | 570.336 | 287.547 | 325.5 | 1485.12 | 495 | 353.474 | 328.432 | 156.391 | 297.28 | 238.483 | 151.2 | 660.577 |
| 773 | 345.711 | 476.411 | 570.336 | 287.547 | 325.5 | 1485.12 | 495 | 353.474 | 328.432 | 156.391 | 297.28 | 238.483 | 151.2 | 660.577 |
| 774 | 345.711 | 476.411 | 570.336 | 287.547 | 325.5 | 1485.12 | 495 | 353.474 | 328.432 | 156.391 | 297.28 | 238.483 | 151.2 | 660.577 |
| 775 | 345.71 | 476.411 | 570.336 | 287.547 | 325.5 | 1485.12 | 495 | 353.474 | 328.432 | 156.391 | 297.28 | 238.483 | 151.2 | 660.577 |
| 776 | 345.71 | 476.411 | 570.336 | 287.547 | 325.5 | 1485.12 | 495 | 353.474 | 328.432 | 156.391 | 297.28 | 238.483 | 151.2 | 660.577 |
| 777 | 345.709 | 476.411 | 570.336 | 287.547 | 325.5 | 1485.12 | 495 | 353.474 | 328.432 | 156.391 | 297.28 | 238.483 | 151.2 | 660.577 |
| 778 | 345.709 | 476.411 | 570.336 | 287.547 | 325.5 | 1485.12 | 495 | 353.474 | 328.432 | 156.391 | 297.28 | 238.483 | 151.2 | 660.577 |
| 779 | 345.708 | 476.411 | 570.336 | 287.547 | 325.5 | 1485.12 | 495 | 353.474 | 328.432 | 156.391 | 297.28 | 238.483 | 151.2 | 660.577 |
| 780 | 345.708 | 476.411 | 570.336 | 287.547 | 325.5 | 1485.12 | 495 | 353.474 | 328.432 | 156.391 | 297.28 | 238.483 | 151.2 | 660.577 |
| 781 | 345.707 | 476.411 | 570.336 | 287.547 | 325.5 | 1485.12 | 495 | 353.474 | 328.432 | 156.391 | 297.28 | 238.483 | 151.2 | 660.577 |
| 782 | 345.707 | 476.411 | 570.336 | 287.547 | 325.5 | 1485.12 | 495 | 353.474 | 328.432 | 156.391 | 297.28 | 238.483 | 151.2 | 660.577 |
| 783 | 345.706 | 476.411 | 570.336 | 287.547 | 325.5 | 1485.12 | 495 | 353.474 | 328.432 | 156.391 | 297.28 | 238.483 | 151.2 | 660.577 |
| 784 | 345.706 | 476.411 | 570.336 | 287.547 | 325.5 | 1485.12 | 495 | 353.474 | 328.432 | 156.391 | 297.28 | 238.483 | 151.2 | 660.577 |
| 785 | 345.705 | 476.411 | 570.336 | 287.547 | 325.5 | 1485.12 | 495 | 353.474 | 328.432 | 156.391 | 297.28 | 238.483 | 151.2 | 660.577 |
| 786 | 345.705 | 476.411 | 570.336 | 287.547 | 325.5 | 1485.12 | 495 | 353.474 | 328.432 | 156.391 | 297.28 | 238.483 | 151.2 | 660.577 |
| 787 | 345.704 | 476.411 | 570.336 | 287.547 | 325.5 | 1485.12 | 495 | 353.474 | 328.432 | 156.391 | 297.28 | 238.483 | 151.2 | 660.577 |
| 788 | 345.704 | 476.411 | 570.336 | 287.547 | 325.5 | 1485.12 | 495 | 353.474 | 328.432 | 156.391 | 297.28 | 238.483 | 151.2 | 660.577 |
| 789 | 345.703 | 476.411 | 570.336 | 287.547 | 325.5 | 1485.12 | 495 | 353.474 | 328.432 | 156.391 | 297.28 | 238.483 | 151.2 | 660.577 |
| 790 | 345.703 | 476.411 | 570.336 | 287.547 | 325.5 | 1485.12 | 495 | 353.474 | 328.432 | 156.391 | 297.28 | 238.483 | 151.2 | 660.577 |
| 791 | 345.702 | 476.411 | 570.336 | 287.547 | 325.5 | 1485.12 | 495 | 353.474 | 328.432 | 156.391 | 297.28 | 238.483 | 151.2 | 660.577 |
| 792 | 345.702 | 476.411 | 570.336 | 287.547 | 325.5 | 1485.12 | 495 | 353.474 | 328.432 | 156.391 | 297.28 | 238.483 | 151.2 | 660.577 |
| 793 | 345.701 | 476.411 | 570.336 | 287.547 | 325.5 | 1485.12 | 495 | 353.474 | 328.432 | 156.391 | 297.28 | 238.483 | 151.2 | 660.577 |
| 794 | 345.701 | 476.411 | 570.336 | 287.547 | 325.5 | 1485.12 | 495 | 353.474 | 328.432 | 156.391 | 297.28 | 238.483 | 151.2 | 660.577 |
| 795 | 345.7 | 476.411 | 570.336 | 287.547 | 325.5 | 1485.12 | 495 | 353.474 | 328.432 | 156.391 | 297.28 | 238.483 | 151.2 | 660.577 |
| 796 | 345.7 | 476.411 | 570.336 | 287.547 | 325.5 | 1485.12 | 495 | 353.474 | 328.432 | 156.391 | 297.28 | 238.483 | 151.2 | 660.577 |
| 797 | 345.699 | 476.411 | 570.336 | 287.547 | 325.5 | 1485.12 | 495 | 353.474 | 328.432 | 156.391 | 297.28 | 238.483 | 151.2 | 660.577 |
| 798 | 345.699 | 476.411 | 570.336 | 287.547 | 325.5 | 1485.12 | 495 | 353.474 | 328.432 | 156.391 | 297.28 | 238.483 | 151.2 | 660.577 |
| 799 | 345.698 | 476.411 | 570.336 | 287.547 | 325.5 | 1485.12 | 495 | 353.474 | 328.432 | 156.391 | 297.28 | 238.483 | 151.2 | 660.577 |